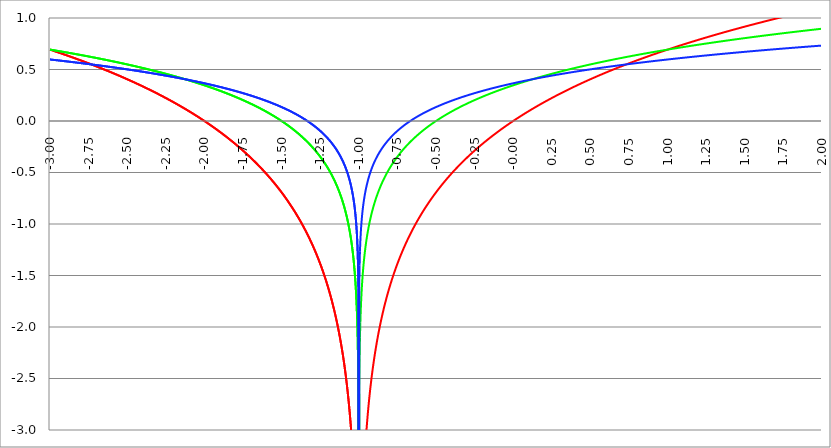
| Category | Series 1 | Series 0 | Series 2 |
|---|---|---|---|
| -3.0 | 0.693 | 0.693 | 0.597 |
| -2.9975 | 0.692 | 0.693 | 0.597 |
| -2.995 | 0.691 | 0.692 | 0.596 |
| -2.9925 | 0.689 | 0.691 | 0.596 |
| -2.99 | 0.688 | 0.691 | 0.596 |
| -2.9875 | 0.687 | 0.69 | 0.595 |
| -2.985 | 0.686 | 0.689 | 0.595 |
| -2.9825 | 0.684 | 0.689 | 0.594 |
| -2.98 | 0.683 | 0.688 | 0.594 |
| -2.9775 | 0.682 | 0.687 | 0.593 |
| -2.975000000000001 | 0.681 | 0.687 | 0.593 |
| -2.972500000000001 | 0.679 | 0.686 | 0.593 |
| -2.970000000000001 | 0.678 | 0.686 | 0.592 |
| -2.967500000000001 | 0.677 | 0.685 | 0.592 |
| -2.965000000000001 | 0.675 | 0.684 | 0.591 |
| -2.962500000000001 | 0.674 | 0.684 | 0.591 |
| -2.960000000000001 | 0.673 | 0.683 | 0.591 |
| -2.957500000000001 | 0.672 | 0.682 | 0.59 |
| -2.955000000000001 | 0.67 | 0.682 | 0.59 |
| -2.952500000000001 | 0.669 | 0.681 | 0.589 |
| -2.950000000000001 | 0.668 | 0.68 | 0.589 |
| -2.947500000000001 | 0.667 | 0.68 | 0.588 |
| -2.945000000000001 | 0.665 | 0.679 | 0.588 |
| -2.942500000000001 | 0.664 | 0.679 | 0.588 |
| -2.940000000000001 | 0.663 | 0.678 | 0.587 |
| -2.937500000000001 | 0.661 | 0.677 | 0.587 |
| -2.935000000000001 | 0.66 | 0.677 | 0.586 |
| -2.932500000000001 | 0.659 | 0.676 | 0.586 |
| -2.930000000000001 | 0.658 | 0.675 | 0.585 |
| -2.927500000000002 | 0.656 | 0.675 | 0.585 |
| -2.925000000000002 | 0.655 | 0.674 | 0.585 |
| -2.922500000000002 | 0.654 | 0.673 | 0.584 |
| -2.920000000000002 | 0.652 | 0.673 | 0.584 |
| -2.917500000000002 | 0.651 | 0.672 | 0.583 |
| -2.915000000000002 | 0.65 | 0.671 | 0.583 |
| -2.912500000000002 | 0.648 | 0.671 | 0.582 |
| -2.910000000000002 | 0.647 | 0.67 | 0.582 |
| -2.907500000000002 | 0.646 | 0.669 | 0.581 |
| -2.905000000000002 | 0.644 | 0.669 | 0.581 |
| -2.902500000000002 | 0.643 | 0.668 | 0.581 |
| -2.900000000000002 | 0.642 | 0.668 | 0.58 |
| -2.897500000000002 | 0.641 | 0.667 | 0.58 |
| -2.895000000000002 | 0.639 | 0.666 | 0.579 |
| -2.892500000000002 | 0.638 | 0.666 | 0.579 |
| -2.890000000000002 | 0.637 | 0.665 | 0.578 |
| -2.887500000000002 | 0.635 | 0.664 | 0.578 |
| -2.885000000000002 | 0.634 | 0.664 | 0.578 |
| -2.882500000000002 | 0.633 | 0.663 | 0.577 |
| -2.880000000000002 | 0.631 | 0.662 | 0.577 |
| -2.877500000000003 | 0.63 | 0.662 | 0.576 |
| -2.875000000000003 | 0.629 | 0.661 | 0.576 |
| -2.872500000000003 | 0.627 | 0.66 | 0.575 |
| -2.870000000000003 | 0.626 | 0.66 | 0.575 |
| -2.867500000000003 | 0.625 | 0.659 | 0.574 |
| -2.865000000000003 | 0.623 | 0.658 | 0.574 |
| -2.862500000000003 | 0.622 | 0.658 | 0.574 |
| -2.860000000000003 | 0.621 | 0.657 | 0.573 |
| -2.857500000000003 | 0.619 | 0.656 | 0.573 |
| -2.855000000000003 | 0.618 | 0.656 | 0.572 |
| -2.852500000000003 | 0.617 | 0.655 | 0.572 |
| -2.850000000000003 | 0.615 | 0.654 | 0.571 |
| -2.847500000000003 | 0.614 | 0.653 | 0.571 |
| -2.845000000000003 | 0.612 | 0.653 | 0.57 |
| -2.842500000000003 | 0.611 | 0.652 | 0.57 |
| -2.840000000000003 | 0.61 | 0.651 | 0.569 |
| -2.837500000000003 | 0.608 | 0.651 | 0.569 |
| -2.835000000000003 | 0.607 | 0.65 | 0.569 |
| -2.832500000000004 | 0.606 | 0.649 | 0.568 |
| -2.830000000000004 | 0.604 | 0.649 | 0.568 |
| -2.827500000000004 | 0.603 | 0.648 | 0.567 |
| -2.825000000000004 | 0.602 | 0.647 | 0.567 |
| -2.822500000000004 | 0.6 | 0.647 | 0.566 |
| -2.820000000000004 | 0.599 | 0.646 | 0.566 |
| -2.817500000000004 | 0.597 | 0.645 | 0.565 |
| -2.815000000000004 | 0.596 | 0.645 | 0.565 |
| -2.812500000000004 | 0.595 | 0.644 | 0.564 |
| -2.810000000000004 | 0.593 | 0.643 | 0.564 |
| -2.807500000000004 | 0.592 | 0.643 | 0.564 |
| -2.805000000000004 | 0.591 | 0.642 | 0.563 |
| -2.802500000000004 | 0.589 | 0.641 | 0.563 |
| -2.800000000000004 | 0.588 | 0.64 | 0.562 |
| -2.797500000000004 | 0.586 | 0.64 | 0.562 |
| -2.795000000000004 | 0.585 | 0.639 | 0.561 |
| -2.792500000000004 | 0.584 | 0.638 | 0.561 |
| -2.790000000000004 | 0.582 | 0.638 | 0.56 |
| -2.787500000000004 | 0.581 | 0.637 | 0.56 |
| -2.785000000000004 | 0.579 | 0.636 | 0.559 |
| -2.782500000000005 | 0.578 | 0.636 | 0.559 |
| -2.780000000000005 | 0.577 | 0.635 | 0.558 |
| -2.777500000000005 | 0.575 | 0.634 | 0.558 |
| -2.775000000000005 | 0.574 | 0.633 | 0.557 |
| -2.772500000000005 | 0.572 | 0.633 | 0.557 |
| -2.770000000000005 | 0.571 | 0.632 | 0.557 |
| -2.767500000000005 | 0.57 | 0.631 | 0.556 |
| -2.765000000000005 | 0.568 | 0.631 | 0.556 |
| -2.762500000000005 | 0.567 | 0.63 | 0.555 |
| -2.760000000000005 | 0.565 | 0.629 | 0.555 |
| -2.757500000000005 | 0.564 | 0.629 | 0.554 |
| -2.755000000000005 | 0.562 | 0.628 | 0.554 |
| -2.752500000000005 | 0.561 | 0.627 | 0.553 |
| -2.750000000000005 | 0.56 | 0.626 | 0.553 |
| -2.747500000000005 | 0.558 | 0.626 | 0.552 |
| -2.745000000000005 | 0.557 | 0.625 | 0.552 |
| -2.742500000000005 | 0.555 | 0.624 | 0.551 |
| -2.740000000000005 | 0.554 | 0.624 | 0.551 |
| -2.737500000000006 | 0.552 | 0.623 | 0.55 |
| -2.735000000000006 | 0.551 | 0.622 | 0.55 |
| -2.732500000000006 | 0.55 | 0.621 | 0.549 |
| -2.730000000000006 | 0.548 | 0.621 | 0.549 |
| -2.727500000000006 | 0.547 | 0.62 | 0.548 |
| -2.725000000000006 | 0.545 | 0.619 | 0.548 |
| -2.722500000000006 | 0.544 | 0.618 | 0.547 |
| -2.720000000000006 | 0.542 | 0.618 | 0.547 |
| -2.717500000000006 | 0.541 | 0.617 | 0.546 |
| -2.715000000000006 | 0.539 | 0.616 | 0.546 |
| -2.712500000000006 | 0.538 | 0.616 | 0.546 |
| -2.710000000000006 | 0.536 | 0.615 | 0.545 |
| -2.707500000000006 | 0.535 | 0.614 | 0.545 |
| -2.705000000000006 | 0.534 | 0.613 | 0.544 |
| -2.702500000000006 | 0.532 | 0.613 | 0.544 |
| -2.700000000000006 | 0.531 | 0.612 | 0.543 |
| -2.697500000000006 | 0.529 | 0.611 | 0.543 |
| -2.695000000000006 | 0.528 | 0.61 | 0.542 |
| -2.692500000000006 | 0.526 | 0.61 | 0.542 |
| -2.690000000000006 | 0.525 | 0.609 | 0.541 |
| -2.687500000000006 | 0.523 | 0.608 | 0.541 |
| -2.685000000000007 | 0.522 | 0.607 | 0.54 |
| -2.682500000000007 | 0.52 | 0.607 | 0.54 |
| -2.680000000000007 | 0.519 | 0.606 | 0.539 |
| -2.677500000000007 | 0.517 | 0.605 | 0.539 |
| -2.675000000000007 | 0.516 | 0.604 | 0.538 |
| -2.672500000000007 | 0.514 | 0.604 | 0.538 |
| -2.670000000000007 | 0.513 | 0.603 | 0.537 |
| -2.667500000000007 | 0.511 | 0.602 | 0.537 |
| -2.665000000000007 | 0.51 | 0.601 | 0.536 |
| -2.662500000000007 | 0.508 | 0.601 | 0.536 |
| -2.660000000000007 | 0.507 | 0.6 | 0.535 |
| -2.657500000000007 | 0.505 | 0.599 | 0.535 |
| -2.655000000000007 | 0.504 | 0.598 | 0.534 |
| -2.652500000000007 | 0.502 | 0.598 | 0.534 |
| -2.650000000000007 | 0.501 | 0.597 | 0.533 |
| -2.647500000000007 | 0.499 | 0.596 | 0.533 |
| -2.645000000000007 | 0.498 | 0.595 | 0.532 |
| -2.642500000000008 | 0.496 | 0.595 | 0.532 |
| -2.640000000000008 | 0.495 | 0.594 | 0.531 |
| -2.637500000000008 | 0.493 | 0.593 | 0.531 |
| -2.635000000000008 | 0.492 | 0.592 | 0.53 |
| -2.632500000000008 | 0.49 | 0.592 | 0.53 |
| -2.630000000000008 | 0.489 | 0.591 | 0.529 |
| -2.627500000000008 | 0.487 | 0.59 | 0.529 |
| -2.625000000000008 | 0.486 | 0.589 | 0.528 |
| -2.622500000000008 | 0.484 | 0.589 | 0.528 |
| -2.620000000000008 | 0.482 | 0.588 | 0.527 |
| -2.617500000000008 | 0.481 | 0.587 | 0.526 |
| -2.615000000000008 | 0.479 | 0.586 | 0.526 |
| -2.612500000000008 | 0.478 | 0.585 | 0.525 |
| -2.610000000000008 | 0.476 | 0.585 | 0.525 |
| -2.607500000000008 | 0.475 | 0.584 | 0.524 |
| -2.605000000000008 | 0.473 | 0.583 | 0.524 |
| -2.602500000000008 | 0.472 | 0.582 | 0.523 |
| -2.600000000000008 | 0.47 | 0.582 | 0.523 |
| -2.597500000000009 | 0.468 | 0.581 | 0.522 |
| -2.595000000000009 | 0.467 | 0.58 | 0.522 |
| -2.592500000000009 | 0.465 | 0.579 | 0.521 |
| -2.590000000000009 | 0.464 | 0.578 | 0.521 |
| -2.587500000000009 | 0.462 | 0.578 | 0.52 |
| -2.585000000000009 | 0.461 | 0.577 | 0.52 |
| -2.582500000000009 | 0.459 | 0.576 | 0.519 |
| -2.580000000000009 | 0.457 | 0.575 | 0.519 |
| -2.577500000000009 | 0.456 | 0.574 | 0.518 |
| -2.575000000000009 | 0.454 | 0.574 | 0.518 |
| -2.572500000000009 | 0.453 | 0.573 | 0.517 |
| -2.570000000000009 | 0.451 | 0.572 | 0.517 |
| -2.56750000000001 | 0.449 | 0.571 | 0.516 |
| -2.565000000000009 | 0.448 | 0.571 | 0.515 |
| -2.562500000000009 | 0.446 | 0.57 | 0.515 |
| -2.560000000000009 | 0.445 | 0.569 | 0.514 |
| -2.557500000000009 | 0.443 | 0.568 | 0.514 |
| -2.555000000000009 | 0.441 | 0.567 | 0.513 |
| -2.55250000000001 | 0.44 | 0.567 | 0.513 |
| -2.55000000000001 | 0.438 | 0.566 | 0.512 |
| -2.54750000000001 | 0.437 | 0.565 | 0.512 |
| -2.54500000000001 | 0.435 | 0.564 | 0.511 |
| -2.54250000000001 | 0.433 | 0.563 | 0.511 |
| -2.54000000000001 | 0.432 | 0.562 | 0.51 |
| -2.53750000000001 | 0.43 | 0.562 | 0.51 |
| -2.53500000000001 | 0.429 | 0.561 | 0.509 |
| -2.53250000000001 | 0.427 | 0.56 | 0.509 |
| -2.53000000000001 | 0.425 | 0.559 | 0.508 |
| -2.52750000000001 | 0.424 | 0.558 | 0.507 |
| -2.52500000000001 | 0.422 | 0.558 | 0.507 |
| -2.52250000000001 | 0.42 | 0.557 | 0.506 |
| -2.52000000000001 | 0.419 | 0.556 | 0.506 |
| -2.51750000000001 | 0.417 | 0.555 | 0.505 |
| -2.51500000000001 | 0.415 | 0.554 | 0.505 |
| -2.51250000000001 | 0.414 | 0.553 | 0.504 |
| -2.51000000000001 | 0.412 | 0.553 | 0.504 |
| -2.50750000000001 | 0.41 | 0.552 | 0.503 |
| -2.505000000000011 | 0.409 | 0.551 | 0.502 |
| -2.502500000000011 | 0.407 | 0.55 | 0.502 |
| -2.500000000000011 | 0.405 | 0.549 | 0.501 |
| -2.497500000000011 | 0.404 | 0.548 | 0.501 |
| -2.495000000000011 | 0.402 | 0.548 | 0.5 |
| -2.492500000000011 | 0.4 | 0.547 | 0.5 |
| -2.490000000000011 | 0.399 | 0.546 | 0.499 |
| -2.487500000000011 | 0.397 | 0.545 | 0.499 |
| -2.485000000000011 | 0.395 | 0.544 | 0.498 |
| -2.482500000000011 | 0.394 | 0.543 | 0.497 |
| -2.480000000000011 | 0.392 | 0.543 | 0.497 |
| -2.477500000000011 | 0.39 | 0.542 | 0.496 |
| -2.475000000000011 | 0.389 | 0.541 | 0.496 |
| -2.472500000000011 | 0.387 | 0.54 | 0.495 |
| -2.470000000000011 | 0.385 | 0.539 | 0.495 |
| -2.467500000000011 | 0.384 | 0.538 | 0.494 |
| -2.465000000000011 | 0.382 | 0.538 | 0.493 |
| -2.462500000000011 | 0.38 | 0.537 | 0.493 |
| -2.460000000000011 | 0.378 | 0.536 | 0.492 |
| -2.457500000000012 | 0.377 | 0.535 | 0.492 |
| -2.455000000000012 | 0.375 | 0.534 | 0.491 |
| -2.452500000000012 | 0.373 | 0.533 | 0.491 |
| -2.450000000000012 | 0.372 | 0.532 | 0.49 |
| -2.447500000000012 | 0.37 | 0.531 | 0.489 |
| -2.445000000000012 | 0.368 | 0.531 | 0.489 |
| -2.442500000000012 | 0.366 | 0.53 | 0.488 |
| -2.440000000000012 | 0.365 | 0.529 | 0.488 |
| -2.437500000000012 | 0.363 | 0.528 | 0.487 |
| -2.435000000000012 | 0.361 | 0.527 | 0.487 |
| -2.432500000000012 | 0.359 | 0.526 | 0.486 |
| -2.430000000000012 | 0.358 | 0.525 | 0.485 |
| -2.427500000000012 | 0.356 | 0.525 | 0.485 |
| -2.425000000000012 | 0.354 | 0.524 | 0.484 |
| -2.422500000000012 | 0.352 | 0.523 | 0.484 |
| -2.420000000000012 | 0.351 | 0.522 | 0.483 |
| -2.417500000000012 | 0.349 | 0.521 | 0.483 |
| -2.415000000000012 | 0.347 | 0.52 | 0.482 |
| -2.412500000000012 | 0.345 | 0.519 | 0.481 |
| -2.410000000000013 | 0.344 | 0.518 | 0.481 |
| -2.407500000000012 | 0.342 | 0.517 | 0.48 |
| -2.405000000000013 | 0.34 | 0.517 | 0.48 |
| -2.402500000000013 | 0.338 | 0.516 | 0.479 |
| -2.400000000000013 | 0.336 | 0.515 | 0.478 |
| -2.397500000000013 | 0.335 | 0.514 | 0.478 |
| -2.395000000000013 | 0.333 | 0.513 | 0.477 |
| -2.392500000000013 | 0.331 | 0.512 | 0.477 |
| -2.390000000000013 | 0.329 | 0.511 | 0.476 |
| -2.387500000000013 | 0.328 | 0.51 | 0.475 |
| -2.385000000000013 | 0.326 | 0.509 | 0.475 |
| -2.382500000000013 | 0.324 | 0.509 | 0.474 |
| -2.380000000000013 | 0.322 | 0.508 | 0.474 |
| -2.377500000000013 | 0.32 | 0.507 | 0.473 |
| -2.375000000000013 | 0.318 | 0.506 | 0.472 |
| -2.372500000000013 | 0.317 | 0.505 | 0.472 |
| -2.370000000000013 | 0.315 | 0.504 | 0.471 |
| -2.367500000000013 | 0.313 | 0.503 | 0.471 |
| -2.365000000000013 | 0.311 | 0.502 | 0.47 |
| -2.362500000000014 | 0.309 | 0.501 | 0.469 |
| -2.360000000000014 | 0.307 | 0.5 | 0.469 |
| -2.357500000000014 | 0.306 | 0.499 | 0.468 |
| -2.355000000000014 | 0.304 | 0.498 | 0.467 |
| -2.352500000000014 | 0.302 | 0.498 | 0.467 |
| -2.350000000000014 | 0.3 | 0.497 | 0.466 |
| -2.347500000000014 | 0.298 | 0.496 | 0.466 |
| -2.345000000000014 | 0.296 | 0.495 | 0.465 |
| -2.342500000000014 | 0.295 | 0.494 | 0.464 |
| -2.340000000000014 | 0.293 | 0.493 | 0.464 |
| -2.337500000000014 | 0.291 | 0.492 | 0.463 |
| -2.335000000000014 | 0.289 | 0.491 | 0.463 |
| -2.332500000000014 | 0.287 | 0.49 | 0.462 |
| -2.330000000000014 | 0.285 | 0.489 | 0.461 |
| -2.327500000000014 | 0.283 | 0.488 | 0.461 |
| -2.325000000000014 | 0.281 | 0.487 | 0.46 |
| -2.322500000000014 | 0.28 | 0.486 | 0.459 |
| -2.320000000000014 | 0.278 | 0.485 | 0.459 |
| -2.317500000000015 | 0.276 | 0.484 | 0.458 |
| -2.315000000000015 | 0.274 | 0.483 | 0.457 |
| -2.312500000000015 | 0.272 | 0.483 | 0.457 |
| -2.310000000000015 | 0.27 | 0.482 | 0.456 |
| -2.307500000000015 | 0.268 | 0.481 | 0.456 |
| -2.305000000000015 | 0.266 | 0.48 | 0.455 |
| -2.302500000000015 | 0.264 | 0.479 | 0.454 |
| -2.300000000000015 | 0.262 | 0.478 | 0.454 |
| -2.297500000000015 | 0.26 | 0.477 | 0.453 |
| -2.295000000000015 | 0.259 | 0.476 | 0.452 |
| -2.292500000000015 | 0.257 | 0.475 | 0.452 |
| -2.290000000000015 | 0.255 | 0.474 | 0.451 |
| -2.287500000000015 | 0.253 | 0.473 | 0.45 |
| -2.285000000000015 | 0.251 | 0.472 | 0.45 |
| -2.282500000000015 | 0.249 | 0.471 | 0.449 |
| -2.280000000000015 | 0.247 | 0.47 | 0.448 |
| -2.277500000000015 | 0.245 | 0.469 | 0.448 |
| -2.275000000000015 | 0.243 | 0.468 | 0.447 |
| -2.272500000000015 | 0.241 | 0.467 | 0.447 |
| -2.270000000000016 | 0.239 | 0.466 | 0.446 |
| -2.267500000000015 | 0.237 | 0.465 | 0.445 |
| -2.265000000000016 | 0.235 | 0.464 | 0.445 |
| -2.262500000000016 | 0.233 | 0.463 | 0.444 |
| -2.260000000000016 | 0.231 | 0.462 | 0.443 |
| -2.257500000000016 | 0.229 | 0.461 | 0.443 |
| -2.255000000000016 | 0.227 | 0.46 | 0.442 |
| -2.252500000000016 | 0.225 | 0.459 | 0.441 |
| -2.250000000000016 | 0.223 | 0.458 | 0.441 |
| -2.247500000000016 | 0.221 | 0.457 | 0.44 |
| -2.245000000000016 | 0.219 | 0.456 | 0.439 |
| -2.242500000000016 | 0.217 | 0.455 | 0.439 |
| -2.240000000000016 | 0.215 | 0.454 | 0.438 |
| -2.237500000000016 | 0.213 | 0.453 | 0.437 |
| -2.235000000000016 | 0.211 | 0.452 | 0.437 |
| -2.232500000000016 | 0.209 | 0.451 | 0.436 |
| -2.230000000000016 | 0.207 | 0.45 | 0.435 |
| -2.227500000000016 | 0.205 | 0.449 | 0.435 |
| -2.225000000000016 | 0.203 | 0.448 | 0.434 |
| -2.222500000000016 | 0.201 | 0.447 | 0.433 |
| -2.220000000000016 | 0.199 | 0.446 | 0.432 |
| -2.217500000000016 | 0.197 | 0.445 | 0.432 |
| -2.215000000000017 | 0.195 | 0.444 | 0.431 |
| -2.212500000000017 | 0.193 | 0.443 | 0.43 |
| -2.210000000000017 | 0.191 | 0.442 | 0.43 |
| -2.207500000000016 | 0.189 | 0.441 | 0.429 |
| -2.205000000000017 | 0.186 | 0.44 | 0.428 |
| -2.202500000000017 | 0.184 | 0.439 | 0.428 |
| -2.200000000000017 | 0.182 | 0.438 | 0.427 |
| -2.197500000000017 | 0.18 | 0.437 | 0.426 |
| -2.195000000000017 | 0.178 | 0.436 | 0.426 |
| -2.192500000000017 | 0.176 | 0.435 | 0.425 |
| -2.190000000000017 | 0.174 | 0.434 | 0.424 |
| -2.187500000000017 | 0.172 | 0.432 | 0.423 |
| -2.185000000000017 | 0.17 | 0.431 | 0.423 |
| -2.182500000000017 | 0.168 | 0.43 | 0.422 |
| -2.180000000000017 | 0.166 | 0.429 | 0.421 |
| -2.177500000000017 | 0.163 | 0.428 | 0.421 |
| -2.175000000000018 | 0.161 | 0.427 | 0.42 |
| -2.172500000000018 | 0.159 | 0.426 | 0.419 |
| -2.170000000000018 | 0.157 | 0.425 | 0.419 |
| -2.167500000000017 | 0.155 | 0.424 | 0.418 |
| -2.165000000000018 | 0.153 | 0.423 | 0.417 |
| -2.162500000000018 | 0.151 | 0.422 | 0.416 |
| -2.160000000000018 | 0.148 | 0.421 | 0.416 |
| -2.157500000000018 | 0.146 | 0.42 | 0.415 |
| -2.155000000000018 | 0.144 | 0.419 | 0.414 |
| -2.152500000000018 | 0.142 | 0.418 | 0.414 |
| -2.150000000000018 | 0.14 | 0.416 | 0.413 |
| -2.147500000000018 | 0.138 | 0.415 | 0.412 |
| -2.145000000000018 | 0.135 | 0.414 | 0.411 |
| -2.142500000000018 | 0.133 | 0.413 | 0.411 |
| -2.140000000000018 | 0.131 | 0.412 | 0.41 |
| -2.137500000000018 | 0.129 | 0.411 | 0.409 |
| -2.135000000000018 | 0.127 | 0.41 | 0.408 |
| -2.132500000000018 | 0.124 | 0.409 | 0.408 |
| -2.130000000000019 | 0.122 | 0.408 | 0.407 |
| -2.127500000000018 | 0.12 | 0.407 | 0.406 |
| -2.125000000000019 | 0.118 | 0.405 | 0.405 |
| -2.122500000000019 | 0.116 | 0.404 | 0.405 |
| -2.120000000000019 | 0.113 | 0.403 | 0.404 |
| -2.117500000000019 | 0.111 | 0.402 | 0.403 |
| -2.115000000000019 | 0.109 | 0.401 | 0.402 |
| -2.112500000000019 | 0.107 | 0.4 | 0.402 |
| -2.110000000000019 | 0.104 | 0.399 | 0.401 |
| -2.10750000000002 | 0.102 | 0.398 | 0.4 |
| -2.10500000000002 | 0.1 | 0.396 | 0.399 |
| -2.10250000000002 | 0.098 | 0.395 | 0.399 |
| -2.10000000000002 | 0.095 | 0.394 | 0.398 |
| -2.09750000000002 | 0.093 | 0.393 | 0.397 |
| -2.095000000000019 | 0.091 | 0.392 | 0.396 |
| -2.092500000000019 | 0.088 | 0.391 | 0.396 |
| -2.090000000000019 | 0.086 | 0.39 | 0.395 |
| -2.08750000000002 | 0.084 | 0.389 | 0.394 |
| -2.085000000000019 | 0.082 | 0.387 | 0.393 |
| -2.08250000000002 | 0.079 | 0.386 | 0.393 |
| -2.08000000000002 | 0.077 | 0.385 | 0.392 |
| -2.07750000000002 | 0.075 | 0.384 | 0.391 |
| -2.07500000000002 | 0.072 | 0.383 | 0.39 |
| -2.07250000000002 | 0.07 | 0.382 | 0.39 |
| -2.07000000000002 | 0.068 | 0.38 | 0.389 |
| -2.06750000000002 | 0.065 | 0.379 | 0.388 |
| -2.06500000000002 | 0.063 | 0.378 | 0.387 |
| -2.06250000000002 | 0.061 | 0.377 | 0.386 |
| -2.06000000000002 | 0.058 | 0.376 | 0.386 |
| -2.05750000000002 | 0.056 | 0.375 | 0.385 |
| -2.05500000000002 | 0.054 | 0.373 | 0.384 |
| -2.05250000000002 | 0.051 | 0.372 | 0.383 |
| -2.05000000000002 | 0.049 | 0.371 | 0.382 |
| -2.04750000000002 | 0.046 | 0.37 | 0.382 |
| -2.04500000000002 | 0.044 | 0.369 | 0.381 |
| -2.04250000000002 | 0.042 | 0.367 | 0.38 |
| -2.04000000000002 | 0.039 | 0.366 | 0.379 |
| -2.037500000000021 | 0.037 | 0.365 | 0.378 |
| -2.035000000000021 | 0.034 | 0.364 | 0.378 |
| -2.032500000000021 | 0.032 | 0.363 | 0.377 |
| -2.030000000000021 | 0.03 | 0.361 | 0.376 |
| -2.027500000000021 | 0.027 | 0.36 | 0.375 |
| -2.025000000000021 | 0.025 | 0.359 | 0.374 |
| -2.022500000000021 | 0.022 | 0.358 | 0.374 |
| -2.020000000000021 | 0.02 | 0.356 | 0.373 |
| -2.017500000000021 | 0.017 | 0.355 | 0.372 |
| -2.015000000000021 | 0.015 | 0.354 | 0.371 |
| -2.012500000000021 | 0.012 | 0.353 | 0.37 |
| -2.010000000000021 | 0.01 | 0.352 | 0.37 |
| -2.007500000000021 | 0.007 | 0.35 | 0.369 |
| -2.005000000000021 | 0.005 | 0.349 | 0.368 |
| -2.002500000000021 | 0.002 | 0.348 | 0.367 |
| -2.000000000000021 | 0 | 0.347 | 0.366 |
| -1.997500000000021 | -0.003 | 0.345 | 0.365 |
| -1.995000000000021 | -0.005 | 0.344 | 0.365 |
| -1.992500000000021 | -0.008 | 0.343 | 0.364 |
| -1.990000000000021 | -0.01 | 0.342 | 0.363 |
| -1.987500000000022 | -0.013 | 0.34 | 0.362 |
| -1.985000000000022 | -0.015 | 0.339 | 0.361 |
| -1.982500000000022 | -0.018 | 0.338 | 0.36 |
| -1.980000000000022 | -0.02 | 0.336 | 0.359 |
| -1.977500000000022 | -0.023 | 0.335 | 0.359 |
| -1.975000000000022 | -0.025 | 0.334 | 0.358 |
| -1.972500000000022 | -0.028 | 0.333 | 0.357 |
| -1.970000000000022 | -0.03 | 0.331 | 0.356 |
| -1.967500000000022 | -0.033 | 0.33 | 0.355 |
| -1.965000000000022 | -0.036 | 0.329 | 0.354 |
| -1.962500000000022 | -0.038 | 0.327 | 0.353 |
| -1.960000000000022 | -0.041 | 0.326 | 0.353 |
| -1.957500000000022 | -0.043 | 0.325 | 0.352 |
| -1.955000000000022 | -0.046 | 0.324 | 0.351 |
| -1.952500000000022 | -0.049 | 0.322 | 0.35 |
| -1.950000000000022 | -0.051 | 0.321 | 0.349 |
| -1.947500000000022 | -0.054 | 0.32 | 0.348 |
| -1.945000000000022 | -0.057 | 0.318 | 0.347 |
| -1.942500000000023 | -0.059 | 0.317 | 0.346 |
| -1.940000000000023 | -0.062 | 0.316 | 0.346 |
| -1.937500000000023 | -0.065 | 0.314 | 0.345 |
| -1.935000000000023 | -0.067 | 0.313 | 0.344 |
| -1.932500000000023 | -0.07 | 0.312 | 0.343 |
| -1.930000000000023 | -0.073 | 0.31 | 0.342 |
| -1.927500000000023 | -0.075 | 0.309 | 0.341 |
| -1.925000000000023 | -0.078 | 0.308 | 0.34 |
| -1.922500000000023 | -0.081 | 0.306 | 0.339 |
| -1.920000000000023 | -0.083 | 0.305 | 0.338 |
| -1.917500000000023 | -0.086 | 0.304 | 0.338 |
| -1.915000000000023 | -0.089 | 0.302 | 0.337 |
| -1.912500000000023 | -0.092 | 0.301 | 0.336 |
| -1.910000000000023 | -0.094 | 0.299 | 0.335 |
| -1.907500000000023 | -0.097 | 0.298 | 0.334 |
| -1.905000000000023 | -0.1 | 0.297 | 0.333 |
| -1.902500000000023 | -0.103 | 0.295 | 0.332 |
| -1.900000000000023 | -0.105 | 0.294 | 0.331 |
| -1.897500000000023 | -0.108 | 0.293 | 0.33 |
| -1.895000000000023 | -0.111 | 0.291 | 0.329 |
| -1.892500000000024 | -0.114 | 0.29 | 0.328 |
| -1.890000000000024 | -0.117 | 0.288 | 0.327 |
| -1.887500000000024 | -0.119 | 0.287 | 0.326 |
| -1.885000000000024 | -0.122 | 0.285 | 0.325 |
| -1.882500000000024 | -0.125 | 0.284 | 0.325 |
| -1.880000000000024 | -0.128 | 0.283 | 0.324 |
| -1.877500000000024 | -0.131 | 0.281 | 0.323 |
| -1.875000000000024 | -0.134 | 0.28 | 0.322 |
| -1.872500000000024 | -0.136 | 0.278 | 0.321 |
| -1.870000000000024 | -0.139 | 0.277 | 0.32 |
| -1.867500000000024 | -0.142 | 0.276 | 0.319 |
| -1.865000000000024 | -0.145 | 0.274 | 0.318 |
| -1.862500000000024 | -0.148 | 0.273 | 0.317 |
| -1.860000000000024 | -0.151 | 0.271 | 0.316 |
| -1.857500000000024 | -0.154 | 0.27 | 0.315 |
| -1.855000000000024 | -0.157 | 0.268 | 0.314 |
| -1.852500000000024 | -0.16 | 0.267 | 0.313 |
| -1.850000000000024 | -0.163 | 0.265 | 0.312 |
| -1.847500000000025 | -0.165 | 0.264 | 0.311 |
| -1.845000000000025 | -0.168 | 0.262 | 0.31 |
| -1.842500000000025 | -0.171 | 0.261 | 0.309 |
| -1.840000000000025 | -0.174 | 0.259 | 0.308 |
| -1.837500000000025 | -0.177 | 0.258 | 0.307 |
| -1.835000000000025 | -0.18 | 0.256 | 0.306 |
| -1.832500000000025 | -0.183 | 0.255 | 0.305 |
| -1.830000000000025 | -0.186 | 0.253 | 0.304 |
| -1.827500000000025 | -0.189 | 0.252 | 0.303 |
| -1.825000000000025 | -0.192 | 0.25 | 0.302 |
| -1.822500000000025 | -0.195 | 0.249 | 0.301 |
| -1.820000000000025 | -0.198 | 0.247 | 0.3 |
| -1.817500000000025 | -0.202 | 0.246 | 0.299 |
| -1.815000000000025 | -0.205 | 0.244 | 0.298 |
| -1.812500000000025 | -0.208 | 0.243 | 0.297 |
| -1.810000000000025 | -0.211 | 0.241 | 0.296 |
| -1.807500000000025 | -0.214 | 0.24 | 0.295 |
| -1.805000000000025 | -0.217 | 0.238 | 0.294 |
| -1.802500000000025 | -0.22 | 0.237 | 0.293 |
| -1.800000000000026 | -0.223 | 0.235 | 0.292 |
| -1.797500000000026 | -0.226 | 0.233 | 0.291 |
| -1.795000000000026 | -0.229 | 0.232 | 0.29 |
| -1.792500000000026 | -0.233 | 0.23 | 0.289 |
| -1.790000000000026 | -0.236 | 0.229 | 0.288 |
| -1.787500000000026 | -0.239 | 0.227 | 0.287 |
| -1.785000000000026 | -0.242 | 0.226 | 0.286 |
| -1.782500000000026 | -0.245 | 0.224 | 0.284 |
| -1.780000000000026 | -0.248 | 0.222 | 0.283 |
| -1.777500000000026 | -0.252 | 0.221 | 0.282 |
| -1.775000000000026 | -0.255 | 0.219 | 0.281 |
| -1.772500000000026 | -0.258 | 0.218 | 0.28 |
| -1.770000000000026 | -0.261 | 0.216 | 0.279 |
| -1.767500000000026 | -0.265 | 0.214 | 0.278 |
| -1.765000000000026 | -0.268 | 0.213 | 0.277 |
| -1.762500000000026 | -0.271 | 0.211 | 0.276 |
| -1.760000000000026 | -0.274 | 0.209 | 0.275 |
| -1.757500000000026 | -0.278 | 0.208 | 0.274 |
| -1.755000000000026 | -0.281 | 0.206 | 0.273 |
| -1.752500000000027 | -0.284 | 0.204 | 0.271 |
| -1.750000000000027 | -0.288 | 0.203 | 0.27 |
| -1.747500000000027 | -0.291 | 0.201 | 0.269 |
| -1.745000000000027 | -0.294 | 0.199 | 0.268 |
| -1.742500000000027 | -0.298 | 0.198 | 0.267 |
| -1.740000000000027 | -0.301 | 0.196 | 0.266 |
| -1.737500000000027 | -0.304 | 0.194 | 0.265 |
| -1.735000000000027 | -0.308 | 0.193 | 0.264 |
| -1.732500000000027 | -0.311 | 0.191 | 0.262 |
| -1.730000000000027 | -0.315 | 0.189 | 0.261 |
| -1.727500000000027 | -0.318 | 0.188 | 0.26 |
| -1.725000000000027 | -0.322 | 0.186 | 0.259 |
| -1.722500000000027 | -0.325 | 0.184 | 0.258 |
| -1.720000000000027 | -0.329 | 0.182 | 0.257 |
| -1.717500000000027 | -0.332 | 0.181 | 0.256 |
| -1.715000000000027 | -0.335 | 0.179 | 0.254 |
| -1.712500000000027 | -0.339 | 0.177 | 0.253 |
| -1.710000000000027 | -0.342 | 0.175 | 0.252 |
| -1.707500000000027 | -0.346 | 0.174 | 0.251 |
| -1.705000000000028 | -0.35 | 0.172 | 0.25 |
| -1.702500000000028 | -0.353 | 0.17 | 0.249 |
| -1.700000000000028 | -0.357 | 0.168 | 0.247 |
| -1.697500000000028 | -0.36 | 0.166 | 0.246 |
| -1.695000000000028 | -0.364 | 0.165 | 0.245 |
| -1.692500000000028 | -0.367 | 0.163 | 0.244 |
| -1.690000000000028 | -0.371 | 0.161 | 0.243 |
| -1.687500000000028 | -0.375 | 0.159 | 0.241 |
| -1.685000000000028 | -0.378 | 0.157 | 0.24 |
| -1.682500000000028 | -0.382 | 0.156 | 0.239 |
| -1.680000000000028 | -0.386 | 0.154 | 0.238 |
| -1.677500000000028 | -0.389 | 0.152 | 0.236 |
| -1.675000000000028 | -0.393 | 0.15 | 0.235 |
| -1.672500000000028 | -0.397 | 0.148 | 0.234 |
| -1.670000000000028 | -0.4 | 0.146 | 0.233 |
| -1.667500000000028 | -0.404 | 0.144 | 0.231 |
| -1.665000000000028 | -0.408 | 0.143 | 0.23 |
| -1.662500000000028 | -0.412 | 0.141 | 0.229 |
| -1.660000000000028 | -0.416 | 0.139 | 0.228 |
| -1.657500000000029 | -0.419 | 0.137 | 0.226 |
| -1.655000000000029 | -0.423 | 0.135 | 0.225 |
| -1.652500000000029 | -0.427 | 0.133 | 0.224 |
| -1.650000000000029 | -0.431 | 0.131 | 0.223 |
| -1.647500000000029 | -0.435 | 0.129 | 0.221 |
| -1.645000000000029 | -0.439 | 0.127 | 0.22 |
| -1.642500000000029 | -0.442 | 0.125 | 0.219 |
| -1.640000000000029 | -0.446 | 0.123 | 0.217 |
| -1.637500000000029 | -0.45 | 0.121 | 0.216 |
| -1.63500000000003 | -0.454 | 0.12 | 0.215 |
| -1.63250000000003 | -0.458 | 0.118 | 0.214 |
| -1.63000000000003 | -0.462 | 0.116 | 0.212 |
| -1.627500000000029 | -0.466 | 0.114 | 0.211 |
| -1.625000000000029 | -0.47 | 0.112 | 0.21 |
| -1.622500000000029 | -0.474 | 0.11 | 0.208 |
| -1.620000000000029 | -0.478 | 0.108 | 0.207 |
| -1.617500000000029 | -0.482 | 0.106 | 0.206 |
| -1.615000000000029 | -0.486 | 0.104 | 0.204 |
| -1.612500000000029 | -0.49 | 0.101 | 0.203 |
| -1.61000000000003 | -0.494 | 0.099 | 0.201 |
| -1.60750000000003 | -0.498 | 0.097 | 0.2 |
| -1.60500000000003 | -0.503 | 0.095 | 0.199 |
| -1.60250000000003 | -0.507 | 0.093 | 0.197 |
| -1.60000000000003 | -0.511 | 0.091 | 0.196 |
| -1.59750000000003 | -0.515 | 0.089 | 0.195 |
| -1.59500000000003 | -0.519 | 0.087 | 0.193 |
| -1.59250000000003 | -0.523 | 0.085 | 0.192 |
| -1.59000000000003 | -0.528 | 0.083 | 0.19 |
| -1.58750000000003 | -0.532 | 0.081 | 0.189 |
| -1.58500000000003 | -0.536 | 0.079 | 0.187 |
| -1.58250000000003 | -0.54 | 0.076 | 0.186 |
| -1.58000000000003 | -0.545 | 0.074 | 0.185 |
| -1.57750000000003 | -0.549 | 0.072 | 0.183 |
| -1.57500000000003 | -0.553 | 0.07 | 0.182 |
| -1.57250000000003 | -0.558 | 0.068 | 0.18 |
| -1.57000000000003 | -0.562 | 0.066 | 0.179 |
| -1.567500000000031 | -0.567 | 0.063 | 0.177 |
| -1.565000000000031 | -0.571 | 0.061 | 0.176 |
| -1.562500000000031 | -0.575 | 0.059 | 0.174 |
| -1.560000000000031 | -0.58 | 0.057 | 0.173 |
| -1.557500000000031 | -0.584 | 0.054 | 0.171 |
| -1.555000000000031 | -0.589 | 0.052 | 0.17 |
| -1.552500000000031 | -0.593 | 0.05 | 0.168 |
| -1.550000000000031 | -0.598 | 0.048 | 0.167 |
| -1.547500000000031 | -0.602 | 0.045 | 0.165 |
| -1.545000000000031 | -0.607 | 0.043 | 0.164 |
| -1.542500000000031 | -0.612 | 0.041 | 0.162 |
| -1.540000000000031 | -0.616 | 0.038 | 0.161 |
| -1.537500000000031 | -0.621 | 0.036 | 0.159 |
| -1.535000000000031 | -0.625 | 0.034 | 0.158 |
| -1.532500000000031 | -0.63 | 0.031 | 0.156 |
| -1.530000000000031 | -0.635 | 0.029 | 0.155 |
| -1.527500000000031 | -0.64 | 0.027 | 0.153 |
| -1.525000000000031 | -0.644 | 0.024 | 0.151 |
| -1.522500000000031 | -0.649 | 0.022 | 0.15 |
| -1.520000000000032 | -0.654 | 0.02 | 0.148 |
| -1.517500000000032 | -0.659 | 0.017 | 0.147 |
| -1.515000000000032 | -0.664 | 0.015 | 0.145 |
| -1.512500000000032 | -0.668 | 0.012 | 0.143 |
| -1.510000000000032 | -0.673 | 0.01 | 0.142 |
| -1.507500000000032 | -0.678 | 0.007 | 0.14 |
| -1.505000000000032 | -0.683 | 0.005 | 0.138 |
| -1.502500000000032 | -0.688 | 0.002 | 0.137 |
| -1.500000000000032 | -0.693 | 0 | 0.135 |
| -1.497500000000032 | -0.698 | -0.003 | 0.133 |
| -1.495000000000032 | -0.703 | -0.005 | 0.132 |
| -1.492500000000032 | -0.708 | -0.008 | 0.13 |
| -1.490000000000032 | -0.713 | -0.01 | 0.128 |
| -1.487500000000032 | -0.718 | -0.013 | 0.127 |
| -1.485000000000032 | -0.724 | -0.015 | 0.125 |
| -1.482500000000032 | -0.729 | -0.018 | 0.123 |
| -1.480000000000032 | -0.734 | -0.02 | 0.122 |
| -1.477500000000032 | -0.739 | -0.023 | 0.12 |
| -1.475000000000032 | -0.744 | -0.026 | 0.118 |
| -1.472500000000033 | -0.75 | -0.028 | 0.116 |
| -1.470000000000033 | -0.755 | -0.031 | 0.115 |
| -1.467500000000033 | -0.76 | -0.034 | 0.113 |
| -1.465000000000033 | -0.766 | -0.036 | 0.111 |
| -1.462500000000033 | -0.771 | -0.039 | 0.109 |
| -1.460000000000033 | -0.777 | -0.042 | 0.107 |
| -1.457500000000033 | -0.782 | -0.044 | 0.106 |
| -1.455000000000033 | -0.787 | -0.047 | 0.104 |
| -1.452500000000033 | -0.793 | -0.05 | 0.102 |
| -1.450000000000033 | -0.799 | -0.053 | 0.1 |
| -1.447500000000033 | -0.804 | -0.055 | 0.098 |
| -1.445000000000033 | -0.81 | -0.058 | 0.096 |
| -1.442500000000033 | -0.815 | -0.061 | 0.094 |
| -1.440000000000033 | -0.821 | -0.064 | 0.093 |
| -1.437500000000033 | -0.827 | -0.067 | 0.091 |
| -1.435000000000033 | -0.832 | -0.07 | 0.089 |
| -1.432500000000033 | -0.838 | -0.073 | 0.087 |
| -1.430000000000033 | -0.844 | -0.075 | 0.085 |
| -1.427500000000033 | -0.85 | -0.078 | 0.083 |
| -1.425000000000034 | -0.856 | -0.081 | 0.081 |
| -1.422500000000034 | -0.862 | -0.084 | 0.079 |
| -1.420000000000034 | -0.868 | -0.087 | 0.077 |
| -1.417500000000034 | -0.873 | -0.09 | 0.075 |
| -1.415000000000034 | -0.879 | -0.093 | 0.073 |
| -1.412500000000034 | -0.886 | -0.096 | 0.071 |
| -1.410000000000034 | -0.892 | -0.099 | 0.069 |
| -1.407500000000034 | -0.898 | -0.102 | 0.067 |
| -1.405000000000034 | -0.904 | -0.105 | 0.065 |
| -1.402500000000034 | -0.91 | -0.108 | 0.063 |
| -1.400000000000034 | -0.916 | -0.112 | 0.061 |
| -1.397500000000034 | -0.923 | -0.115 | 0.059 |
| -1.395000000000034 | -0.929 | -0.118 | 0.057 |
| -1.392500000000034 | -0.935 | -0.121 | 0.054 |
| -1.390000000000034 | -0.942 | -0.124 | 0.052 |
| -1.387500000000034 | -0.948 | -0.127 | 0.05 |
| -1.385000000000034 | -0.955 | -0.131 | 0.048 |
| -1.382500000000034 | -0.961 | -0.134 | 0.046 |
| -1.380000000000034 | -0.968 | -0.137 | 0.044 |
| -1.377500000000035 | -0.974 | -0.141 | 0.041 |
| -1.375000000000035 | -0.981 | -0.144 | 0.039 |
| -1.372500000000035 | -0.988 | -0.147 | 0.037 |
| -1.370000000000035 | -0.994 | -0.151 | 0.035 |
| -1.367500000000035 | -1.001 | -0.154 | 0.033 |
| -1.365000000000035 | -1.008 | -0.157 | 0.03 |
| -1.362500000000035 | -1.015 | -0.161 | 0.028 |
| -1.360000000000035 | -1.022 | -0.164 | 0.026 |
| -1.357500000000035 | -1.029 | -0.168 | 0.023 |
| -1.355000000000035 | -1.036 | -0.171 | 0.021 |
| -1.352500000000035 | -1.043 | -0.175 | 0.019 |
| -1.350000000000035 | -1.05 | -0.178 | 0.016 |
| -1.347500000000035 | -1.057 | -0.182 | 0.014 |
| -1.345000000000035 | -1.064 | -0.186 | 0.011 |
| -1.342500000000035 | -1.071 | -0.189 | 0.009 |
| -1.340000000000035 | -1.079 | -0.193 | 0.007 |
| -1.337500000000035 | -1.086 | -0.197 | 0.004 |
| -1.335000000000035 | -1.094 | -0.2 | 0.002 |
| -1.332500000000035 | -1.101 | -0.204 | -0.001 |
| -1.330000000000036 | -1.109 | -0.208 | -0.003 |
| -1.327500000000036 | -1.116 | -0.212 | -0.006 |
| -1.325000000000036 | -1.124 | -0.215 | -0.008 |
| -1.322500000000036 | -1.132 | -0.219 | -0.011 |
| -1.320000000000036 | -1.139 | -0.223 | -0.014 |
| -1.317500000000036 | -1.147 | -0.227 | -0.016 |
| -1.315000000000036 | -1.155 | -0.231 | -0.019 |
| -1.312500000000036 | -1.163 | -0.235 | -0.022 |
| -1.310000000000036 | -1.171 | -0.239 | -0.024 |
| -1.307500000000036 | -1.179 | -0.243 | -0.027 |
| -1.305000000000036 | -1.187 | -0.247 | -0.03 |
| -1.302500000000036 | -1.196 | -0.251 | -0.032 |
| -1.300000000000036 | -1.204 | -0.255 | -0.035 |
| -1.297500000000036 | -1.212 | -0.26 | -0.038 |
| -1.295000000000036 | -1.221 | -0.264 | -0.041 |
| -1.292500000000036 | -1.229 | -0.268 | -0.044 |
| -1.290000000000036 | -1.238 | -0.272 | -0.046 |
| -1.287500000000036 | -1.247 | -0.277 | -0.049 |
| -1.285000000000037 | -1.255 | -0.281 | -0.052 |
| -1.282500000000037 | -1.264 | -0.285 | -0.055 |
| -1.280000000000037 | -1.273 | -0.29 | -0.058 |
| -1.277500000000037 | -1.282 | -0.294 | -0.061 |
| -1.275000000000037 | -1.291 | -0.299 | -0.064 |
| -1.272500000000037 | -1.3 | -0.303 | -0.067 |
| -1.270000000000037 | -1.309 | -0.308 | -0.07 |
| -1.267500000000037 | -1.319 | -0.313 | -0.073 |
| -1.265000000000037 | -1.328 | -0.317 | -0.076 |
| -1.262500000000037 | -1.338 | -0.322 | -0.08 |
| -1.260000000000037 | -1.347 | -0.327 | -0.083 |
| -1.257500000000037 | -1.357 | -0.332 | -0.086 |
| -1.255000000000037 | -1.366 | -0.337 | -0.089 |
| -1.252500000000037 | -1.376 | -0.342 | -0.093 |
| -1.250000000000037 | -1.386 | -0.347 | -0.096 |
| -1.247500000000037 | -1.396 | -0.352 | -0.099 |
| -1.245000000000037 | -1.406 | -0.357 | -0.103 |
| -1.242500000000037 | -1.417 | -0.362 | -0.106 |
| -1.240000000000037 | -1.427 | -0.367 | -0.11 |
| -1.237500000000038 | -1.438 | -0.372 | -0.113 |
| -1.235000000000038 | -1.448 | -0.378 | -0.117 |
| -1.232500000000038 | -1.459 | -0.383 | -0.12 |
| -1.230000000000038 | -1.47 | -0.388 | -0.124 |
| -1.227500000000038 | -1.481 | -0.394 | -0.127 |
| -1.225000000000038 | -1.492 | -0.399 | -0.131 |
| -1.222500000000038 | -1.503 | -0.405 | -0.135 |
| -1.220000000000038 | -1.514 | -0.41 | -0.139 |
| -1.217500000000038 | -1.526 | -0.416 | -0.142 |
| -1.215000000000038 | -1.537 | -0.422 | -0.146 |
| -1.212500000000038 | -1.549 | -0.428 | -0.15 |
| -1.210000000000038 | -1.561 | -0.434 | -0.154 |
| -1.207500000000038 | -1.573 | -0.44 | -0.158 |
| -1.205000000000038 | -1.585 | -0.446 | -0.162 |
| -1.202500000000038 | -1.597 | -0.452 | -0.166 |
| -1.200000000000038 | -1.609 | -0.458 | -0.17 |
| -1.197500000000038 | -1.622 | -0.464 | -0.174 |
| -1.195000000000038 | -1.635 | -0.471 | -0.179 |
| -1.192500000000038 | -1.648 | -0.477 | -0.183 |
| -1.190000000000039 | -1.661 | -0.484 | -0.187 |
| -1.187500000000039 | -1.674 | -0.49 | -0.192 |
| -1.185000000000039 | -1.687 | -0.497 | -0.196 |
| -1.182500000000039 | -1.701 | -0.504 | -0.201 |
| -1.180000000000039 | -1.715 | -0.511 | -0.205 |
| -1.177500000000039 | -1.729 | -0.518 | -0.21 |
| -1.175000000000039 | -1.743 | -0.525 | -0.215 |
| -1.172500000000039 | -1.757 | -0.532 | -0.22 |
| -1.170000000000039 | -1.772 | -0.539 | -0.224 |
| -1.16750000000004 | -1.787 | -0.547 | -0.229 |
| -1.16500000000004 | -1.802 | -0.554 | -0.234 |
| -1.16250000000004 | -1.817 | -0.562 | -0.239 |
| -1.16000000000004 | -1.833 | -0.57 | -0.245 |
| -1.157500000000039 | -1.848 | -0.578 | -0.25 |
| -1.155000000000039 | -1.864 | -0.586 | -0.255 |
| -1.152500000000039 | -1.881 | -0.594 | -0.261 |
| -1.150000000000039 | -1.897 | -0.602 | -0.266 |
| -1.147500000000039 | -1.914 | -0.61 | -0.272 |
| -1.14500000000004 | -1.931 | -0.619 | -0.277 |
| -1.14250000000004 | -1.948 | -0.628 | -0.283 |
| -1.14000000000004 | -1.966 | -0.636 | -0.289 |
| -1.13750000000004 | -1.984 | -0.645 | -0.295 |
| -1.13500000000004 | -2.002 | -0.655 | -0.301 |
| -1.13250000000004 | -2.021 | -0.664 | -0.308 |
| -1.13000000000004 | -2.04 | -0.674 | -0.314 |
| -1.12750000000004 | -2.06 | -0.683 | -0.32 |
| -1.12500000000004 | -2.079 | -0.693 | -0.327 |
| -1.12250000000004 | -2.1 | -0.703 | -0.334 |
| -1.12000000000004 | -2.12 | -0.714 | -0.341 |
| -1.11750000000004 | -2.141 | -0.724 | -0.348 |
| -1.11500000000004 | -2.163 | -0.735 | -0.355 |
| -1.11250000000004 | -2.185 | -0.746 | -0.362 |
| -1.11000000000004 | -2.207 | -0.757 | -0.37 |
| -1.10750000000004 | -2.23 | -0.769 | -0.377 |
| -1.10500000000004 | -2.254 | -0.78 | -0.385 |
| -1.10250000000004 | -2.278 | -0.792 | -0.393 |
| -1.10000000000004 | -2.303 | -0.805 | -0.401 |
| -1.097500000000041 | -2.328 | -0.817 | -0.41 |
| -1.095000000000041 | -2.354 | -0.83 | -0.418 |
| -1.092500000000041 | -2.381 | -0.844 | -0.427 |
| -1.090000000000041 | -2.408 | -0.857 | -0.436 |
| -1.087500000000041 | -2.436 | -0.871 | -0.446 |
| -1.085000000000041 | -2.465 | -0.886 | -0.455 |
| -1.082500000000041 | -2.495 | -0.901 | -0.465 |
| -1.080000000000041 | -2.526 | -0.916 | -0.476 |
| -1.077500000000041 | -2.557 | -0.932 | -0.486 |
| -1.075000000000041 | -2.59 | -0.949 | -0.497 |
| -1.072500000000041 | -2.624 | -0.966 | -0.509 |
| -1.070000000000041 | -2.659 | -0.983 | -0.52 |
| -1.067500000000041 | -2.696 | -1.001 | -0.532 |
| -1.065000000000041 | -2.733 | -1.02 | -0.545 |
| -1.062500000000041 | -2.773 | -1.04 | -0.558 |
| -1.060000000000041 | -2.813 | -1.06 | -0.572 |
| -1.057500000000041 | -2.856 | -1.081 | -0.586 |
| -1.055000000000041 | -2.9 | -1.104 | -0.601 |
| -1.052500000000042 | -2.947 | -1.127 | -0.616 |
| -1.050000000000042 | -2.996 | -1.151 | -0.632 |
| -1.047500000000042 | -3.047 | -1.177 | -0.649 |
| -1.045000000000042 | -3.101 | -1.204 | -0.667 |
| -1.042500000000042 | -3.158 | -1.233 | -0.687 |
| -1.040000000000042 | -3.219 | -1.263 | -0.707 |
| -1.037500000000042 | -3.283 | -1.295 | -0.728 |
| -1.035000000000042 | -3.352 | -1.33 | -0.751 |
| -1.032500000000042 | -3.427 | -1.367 | -0.776 |
| -1.030000000000042 | -3.507 | -1.407 | -0.803 |
| -1.027500000000042 | -3.594 | -1.45 | -0.832 |
| -1.025000000000042 | -3.689 | -1.498 | -0.863 |
| -1.022500000000042 | -3.794 | -1.551 | -0.899 |
| -1.020000000000042 | -3.912 | -1.609 | -0.938 |
| -1.017500000000042 | -4.046 | -1.676 | -0.982 |
| -1.015000000000042 | -4.2 | -1.753 | -1.034 |
| -1.012500000000042 | -4.382 | -1.844 | -1.094 |
| -1.010000000000042 | -4.605 | -1.956 | -1.169 |
| -1.007500000000042 | -4.893 | -2.1 | -1.265 |
| -1.005000000000043 | -5.298 | -2.303 | -1.4 |
| -1.002500000000043 | -5.991 | -2.649 | -1.631 |
| -1.000000000000043 | -30.786 | -15.047 | -9.896 |
| -0.997500000000043 | -5.991 | -2.649 | -1.631 |
| -0.995000000000043 | -5.298 | -2.303 | -1.4 |
| -0.992500000000043 | -4.893 | -2.1 | -1.265 |
| -0.990000000000043 | -4.605 | -1.956 | -1.169 |
| -0.987500000000043 | -4.382 | -1.844 | -1.094 |
| -0.985000000000043 | -4.2 | -1.753 | -1.034 |
| -0.982500000000043 | -4.046 | -1.676 | -0.982 |
| -0.980000000000043 | -3.912 | -1.609 | -0.938 |
| -0.977500000000043 | -3.794 | -1.551 | -0.899 |
| -0.975000000000043 | -3.689 | -1.498 | -0.863 |
| -0.972500000000043 | -3.594 | -1.45 | -0.832 |
| -0.970000000000043 | -3.507 | -1.407 | -0.803 |
| -0.967500000000043 | -3.427 | -1.367 | -0.776 |
| -0.965000000000043 | -3.352 | -1.33 | -0.751 |
| -0.962500000000043 | -3.283 | -1.295 | -0.728 |
| -0.960000000000043 | -3.219 | -1.263 | -0.707 |
| -0.957500000000044 | -3.158 | -1.233 | -0.687 |
| -0.955000000000044 | -3.101 | -1.204 | -0.667 |
| -0.952500000000044 | -3.047 | -1.177 | -0.649 |
| -0.950000000000044 | -2.996 | -1.151 | -0.632 |
| -0.947500000000044 | -2.947 | -1.127 | -0.616 |
| -0.945000000000044 | -2.9 | -1.104 | -0.601 |
| -0.942500000000044 | -2.856 | -1.081 | -0.586 |
| -0.940000000000044 | -2.813 | -1.06 | -0.572 |
| -0.937500000000044 | -2.773 | -1.04 | -0.558 |
| -0.935000000000044 | -2.733 | -1.02 | -0.545 |
| -0.932500000000044 | -2.696 | -1.001 | -0.532 |
| -0.930000000000044 | -2.659 | -0.983 | -0.52 |
| -0.927500000000044 | -2.624 | -0.966 | -0.509 |
| -0.925000000000044 | -2.59 | -0.949 | -0.497 |
| -0.922500000000044 | -2.557 | -0.932 | -0.486 |
| -0.920000000000044 | -2.526 | -0.916 | -0.476 |
| -0.917500000000044 | -2.495 | -0.901 | -0.465 |
| -0.915000000000044 | -2.465 | -0.886 | -0.455 |
| -0.912500000000044 | -2.436 | -0.871 | -0.446 |
| -0.910000000000045 | -2.408 | -0.857 | -0.436 |
| -0.907500000000045 | -2.381 | -0.844 | -0.427 |
| -0.905000000000045 | -2.354 | -0.83 | -0.418 |
| -0.902500000000045 | -2.328 | -0.817 | -0.41 |
| -0.900000000000045 | -2.303 | -0.805 | -0.401 |
| -0.897500000000045 | -2.278 | -0.792 | -0.393 |
| -0.895000000000045 | -2.254 | -0.78 | -0.385 |
| -0.892500000000045 | -2.23 | -0.769 | -0.377 |
| -0.890000000000045 | -2.207 | -0.757 | -0.37 |
| -0.887500000000045 | -2.185 | -0.746 | -0.362 |
| -0.885000000000045 | -2.163 | -0.735 | -0.355 |
| -0.882500000000045 | -2.141 | -0.724 | -0.348 |
| -0.880000000000045 | -2.12 | -0.714 | -0.341 |
| -0.877500000000045 | -2.1 | -0.703 | -0.334 |
| -0.875000000000045 | -2.079 | -0.693 | -0.327 |
| -0.872500000000045 | -2.06 | -0.683 | -0.32 |
| -0.870000000000045 | -2.04 | -0.674 | -0.314 |
| -0.867500000000045 | -2.021 | -0.664 | -0.308 |
| -0.865000000000045 | -2.002 | -0.655 | -0.301 |
| -0.862500000000046 | -1.984 | -0.645 | -0.295 |
| -0.860000000000046 | -1.966 | -0.636 | -0.289 |
| -0.857500000000046 | -1.948 | -0.628 | -0.283 |
| -0.855000000000046 | -1.931 | -0.619 | -0.277 |
| -0.852500000000046 | -1.914 | -0.61 | -0.272 |
| -0.850000000000046 | -1.897 | -0.602 | -0.266 |
| -0.847500000000046 | -1.881 | -0.594 | -0.261 |
| -0.845000000000046 | -1.864 | -0.586 | -0.255 |
| -0.842500000000046 | -1.848 | -0.578 | -0.25 |
| -0.840000000000046 | -1.833 | -0.57 | -0.245 |
| -0.837500000000046 | -1.817 | -0.562 | -0.239 |
| -0.835000000000046 | -1.802 | -0.554 | -0.234 |
| -0.832500000000046 | -1.787 | -0.547 | -0.229 |
| -0.830000000000046 | -1.772 | -0.539 | -0.224 |
| -0.827500000000046 | -1.757 | -0.532 | -0.22 |
| -0.825000000000046 | -1.743 | -0.525 | -0.215 |
| -0.822500000000046 | -1.729 | -0.518 | -0.21 |
| -0.820000000000046 | -1.715 | -0.511 | -0.205 |
| -0.817500000000046 | -1.701 | -0.504 | -0.201 |
| -0.815000000000047 | -1.687 | -0.497 | -0.196 |
| -0.812500000000047 | -1.674 | -0.49 | -0.192 |
| -0.810000000000047 | -1.661 | -0.484 | -0.187 |
| -0.807500000000047 | -1.648 | -0.477 | -0.183 |
| -0.805000000000047 | -1.635 | -0.471 | -0.179 |
| -0.802500000000047 | -1.622 | -0.464 | -0.174 |
| -0.800000000000047 | -1.609 | -0.458 | -0.17 |
| -0.797500000000047 | -1.597 | -0.452 | -0.166 |
| -0.795000000000047 | -1.585 | -0.446 | -0.162 |
| -0.792500000000047 | -1.573 | -0.44 | -0.158 |
| -0.790000000000047 | -1.561 | -0.434 | -0.154 |
| -0.787500000000047 | -1.549 | -0.428 | -0.15 |
| -0.785000000000047 | -1.537 | -0.422 | -0.146 |
| -0.782500000000047 | -1.526 | -0.416 | -0.142 |
| -0.780000000000047 | -1.514 | -0.41 | -0.139 |
| -0.777500000000047 | -1.503 | -0.405 | -0.135 |
| -0.775000000000047 | -1.492 | -0.399 | -0.131 |
| -0.772500000000047 | -1.481 | -0.394 | -0.127 |
| -0.770000000000047 | -1.47 | -0.388 | -0.124 |
| -0.767500000000048 | -1.459 | -0.383 | -0.12 |
| -0.765000000000048 | -1.448 | -0.378 | -0.117 |
| -0.762500000000048 | -1.438 | -0.372 | -0.113 |
| -0.760000000000048 | -1.427 | -0.367 | -0.11 |
| -0.757500000000048 | -1.417 | -0.362 | -0.106 |
| -0.755000000000048 | -1.406 | -0.357 | -0.103 |
| -0.752500000000048 | -1.396 | -0.352 | -0.099 |
| -0.750000000000048 | -1.386 | -0.347 | -0.096 |
| -0.747500000000048 | -1.376 | -0.342 | -0.093 |
| -0.745000000000048 | -1.366 | -0.337 | -0.089 |
| -0.742500000000048 | -1.357 | -0.332 | -0.086 |
| -0.740000000000048 | -1.347 | -0.327 | -0.083 |
| -0.737500000000048 | -1.338 | -0.322 | -0.08 |
| -0.735000000000048 | -1.328 | -0.317 | -0.076 |
| -0.732500000000048 | -1.319 | -0.313 | -0.073 |
| -0.730000000000048 | -1.309 | -0.308 | -0.07 |
| -0.727500000000048 | -1.3 | -0.303 | -0.067 |
| -0.725000000000048 | -1.291 | -0.299 | -0.064 |
| -0.722500000000048 | -1.282 | -0.294 | -0.061 |
| -0.720000000000049 | -1.273 | -0.29 | -0.058 |
| -0.717500000000049 | -1.264 | -0.285 | -0.055 |
| -0.715000000000049 | -1.255 | -0.281 | -0.052 |
| -0.712500000000049 | -1.247 | -0.277 | -0.049 |
| -0.710000000000049 | -1.238 | -0.272 | -0.046 |
| -0.707500000000049 | -1.229 | -0.268 | -0.044 |
| -0.705000000000049 | -1.221 | -0.264 | -0.041 |
| -0.702500000000049 | -1.212 | -0.26 | -0.038 |
| -0.700000000000049 | -1.204 | -0.255 | -0.035 |
| -0.697500000000049 | -1.196 | -0.251 | -0.032 |
| -0.695000000000049 | -1.187 | -0.247 | -0.03 |
| -0.692500000000049 | -1.179 | -0.243 | -0.027 |
| -0.690000000000049 | -1.171 | -0.239 | -0.024 |
| -0.687500000000049 | -1.163 | -0.235 | -0.022 |
| -0.685000000000049 | -1.155 | -0.231 | -0.019 |
| -0.682500000000049 | -1.147 | -0.227 | -0.016 |
| -0.680000000000049 | -1.139 | -0.223 | -0.014 |
| -0.677500000000049 | -1.132 | -0.219 | -0.011 |
| -0.675000000000049 | -1.124 | -0.215 | -0.008 |
| -0.67250000000005 | -1.116 | -0.212 | -0.006 |
| -0.67000000000005 | -1.109 | -0.208 | -0.003 |
| -0.66750000000005 | -1.101 | -0.204 | -0.001 |
| -0.66500000000005 | -1.094 | -0.2 | 0.002 |
| -0.66250000000005 | -1.086 | -0.197 | 0.004 |
| -0.66000000000005 | -1.079 | -0.193 | 0.007 |
| -0.65750000000005 | -1.071 | -0.189 | 0.009 |
| -0.65500000000005 | -1.064 | -0.186 | 0.011 |
| -0.65250000000005 | -1.057 | -0.182 | 0.014 |
| -0.65000000000005 | -1.05 | -0.178 | 0.016 |
| -0.64750000000005 | -1.043 | -0.175 | 0.019 |
| -0.64500000000005 | -1.036 | -0.171 | 0.021 |
| -0.64250000000005 | -1.029 | -0.168 | 0.023 |
| -0.64000000000005 | -1.022 | -0.164 | 0.026 |
| -0.63750000000005 | -1.015 | -0.161 | 0.028 |
| -0.63500000000005 | -1.008 | -0.157 | 0.03 |
| -0.63250000000005 | -1.001 | -0.154 | 0.033 |
| -0.63000000000005 | -0.994 | -0.151 | 0.035 |
| -0.62750000000005 | -0.988 | -0.147 | 0.037 |
| -0.625000000000051 | -0.981 | -0.144 | 0.039 |
| -0.622500000000051 | -0.974 | -0.141 | 0.041 |
| -0.620000000000051 | -0.968 | -0.137 | 0.044 |
| -0.617500000000051 | -0.961 | -0.134 | 0.046 |
| -0.615000000000051 | -0.955 | -0.131 | 0.048 |
| -0.612500000000051 | -0.948 | -0.127 | 0.05 |
| -0.610000000000051 | -0.942 | -0.124 | 0.052 |
| -0.607500000000051 | -0.935 | -0.121 | 0.054 |
| -0.605000000000051 | -0.929 | -0.118 | 0.057 |
| -0.602500000000051 | -0.923 | -0.115 | 0.059 |
| -0.600000000000051 | -0.916 | -0.112 | 0.061 |
| -0.597500000000051 | -0.91 | -0.108 | 0.063 |
| -0.595000000000051 | -0.904 | -0.105 | 0.065 |
| -0.592500000000051 | -0.898 | -0.102 | 0.067 |
| -0.590000000000051 | -0.892 | -0.099 | 0.069 |
| -0.587500000000051 | -0.886 | -0.096 | 0.071 |
| -0.585000000000051 | -0.879 | -0.093 | 0.073 |
| -0.582500000000052 | -0.873 | -0.09 | 0.075 |
| -0.580000000000052 | -0.868 | -0.087 | 0.077 |
| -0.577500000000052 | -0.862 | -0.084 | 0.079 |
| -0.575000000000052 | -0.856 | -0.081 | 0.081 |
| -0.572500000000052 | -0.85 | -0.078 | 0.083 |
| -0.570000000000052 | -0.844 | -0.075 | 0.085 |
| -0.567500000000052 | -0.838 | -0.073 | 0.087 |
| -0.565000000000052 | -0.832 | -0.07 | 0.089 |
| -0.562500000000052 | -0.827 | -0.067 | 0.091 |
| -0.560000000000052 | -0.821 | -0.064 | 0.093 |
| -0.557500000000052 | -0.815 | -0.061 | 0.094 |
| -0.555000000000052 | -0.81 | -0.058 | 0.096 |
| -0.552500000000052 | -0.804 | -0.055 | 0.098 |
| -0.550000000000052 | -0.799 | -0.053 | 0.1 |
| -0.547500000000052 | -0.793 | -0.05 | 0.102 |
| -0.545000000000052 | -0.787 | -0.047 | 0.104 |
| -0.542500000000052 | -0.782 | -0.044 | 0.106 |
| -0.540000000000052 | -0.777 | -0.042 | 0.107 |
| -0.537500000000052 | -0.771 | -0.039 | 0.109 |
| -0.535000000000053 | -0.766 | -0.036 | 0.111 |
| -0.532500000000053 | -0.76 | -0.034 | 0.113 |
| -0.530000000000053 | -0.755 | -0.031 | 0.115 |
| -0.527500000000053 | -0.75 | -0.028 | 0.116 |
| -0.525000000000053 | -0.744 | -0.026 | 0.118 |
| -0.522500000000053 | -0.739 | -0.023 | 0.12 |
| -0.520000000000053 | -0.734 | -0.02 | 0.122 |
| -0.517500000000053 | -0.729 | -0.018 | 0.123 |
| -0.515000000000053 | -0.724 | -0.015 | 0.125 |
| -0.512500000000053 | -0.718 | -0.013 | 0.127 |
| -0.510000000000053 | -0.713 | -0.01 | 0.128 |
| -0.507500000000053 | -0.708 | -0.008 | 0.13 |
| -0.505000000000053 | -0.703 | -0.005 | 0.132 |
| -0.502500000000053 | -0.698 | -0.003 | 0.133 |
| -0.500000000000053 | -0.693 | 0 | 0.135 |
| -0.497500000000053 | -0.688 | 0.002 | 0.137 |
| -0.495000000000053 | -0.683 | 0.005 | 0.138 |
| -0.492500000000053 | -0.678 | 0.007 | 0.14 |
| -0.490000000000053 | -0.673 | 0.01 | 0.142 |
| -0.487500000000053 | -0.668 | 0.012 | 0.143 |
| -0.485000000000053 | -0.664 | 0.015 | 0.145 |
| -0.482500000000053 | -0.659 | 0.017 | 0.147 |
| -0.480000000000053 | -0.654 | 0.02 | 0.148 |
| -0.477500000000053 | -0.649 | 0.022 | 0.15 |
| -0.475000000000053 | -0.644 | 0.024 | 0.151 |
| -0.472500000000053 | -0.64 | 0.027 | 0.153 |
| -0.470000000000053 | -0.635 | 0.029 | 0.155 |
| -0.467500000000053 | -0.63 | 0.031 | 0.156 |
| -0.465000000000053 | -0.625 | 0.034 | 0.158 |
| -0.462500000000053 | -0.621 | 0.036 | 0.159 |
| -0.460000000000053 | -0.616 | 0.038 | 0.161 |
| -0.457500000000053 | -0.612 | 0.041 | 0.162 |
| -0.455000000000053 | -0.607 | 0.043 | 0.164 |
| -0.452500000000053 | -0.602 | 0.045 | 0.165 |
| -0.450000000000053 | -0.598 | 0.048 | 0.167 |
| -0.447500000000053 | -0.593 | 0.05 | 0.168 |
| -0.445000000000053 | -0.589 | 0.052 | 0.17 |
| -0.442500000000053 | -0.584 | 0.054 | 0.171 |
| -0.440000000000053 | -0.58 | 0.057 | 0.173 |
| -0.437500000000053 | -0.575 | 0.059 | 0.174 |
| -0.435000000000053 | -0.571 | 0.061 | 0.176 |
| -0.432500000000053 | -0.567 | 0.063 | 0.177 |
| -0.430000000000053 | -0.562 | 0.066 | 0.179 |
| -0.427500000000053 | -0.558 | 0.068 | 0.18 |
| -0.425000000000053 | -0.553 | 0.07 | 0.182 |
| -0.422500000000053 | -0.549 | 0.072 | 0.183 |
| -0.420000000000053 | -0.545 | 0.074 | 0.185 |
| -0.417500000000053 | -0.54 | 0.076 | 0.186 |
| -0.415000000000053 | -0.536 | 0.079 | 0.187 |
| -0.412500000000053 | -0.532 | 0.081 | 0.189 |
| -0.410000000000053 | -0.528 | 0.083 | 0.19 |
| -0.407500000000053 | -0.523 | 0.085 | 0.192 |
| -0.405000000000053 | -0.519 | 0.087 | 0.193 |
| -0.402500000000053 | -0.515 | 0.089 | 0.195 |
| -0.400000000000053 | -0.511 | 0.091 | 0.196 |
| -0.397500000000053 | -0.507 | 0.093 | 0.197 |
| -0.395000000000053 | -0.503 | 0.095 | 0.199 |
| -0.392500000000053 | -0.498 | 0.097 | 0.2 |
| -0.390000000000053 | -0.494 | 0.099 | 0.201 |
| -0.387500000000053 | -0.49 | 0.101 | 0.203 |
| -0.385000000000053 | -0.486 | 0.104 | 0.204 |
| -0.382500000000053 | -0.482 | 0.106 | 0.206 |
| -0.380000000000053 | -0.478 | 0.108 | 0.207 |
| -0.377500000000053 | -0.474 | 0.11 | 0.208 |
| -0.375000000000053 | -0.47 | 0.112 | 0.21 |
| -0.372500000000053 | -0.466 | 0.114 | 0.211 |
| -0.370000000000053 | -0.462 | 0.116 | 0.212 |
| -0.367500000000053 | -0.458 | 0.118 | 0.214 |
| -0.365000000000053 | -0.454 | 0.12 | 0.215 |
| -0.362500000000053 | -0.45 | 0.121 | 0.216 |
| -0.360000000000053 | -0.446 | 0.123 | 0.217 |
| -0.357500000000053 | -0.442 | 0.125 | 0.219 |
| -0.355000000000053 | -0.439 | 0.127 | 0.22 |
| -0.352500000000053 | -0.435 | 0.129 | 0.221 |
| -0.350000000000053 | -0.431 | 0.131 | 0.223 |
| -0.347500000000053 | -0.427 | 0.133 | 0.224 |
| -0.345000000000053 | -0.423 | 0.135 | 0.225 |
| -0.342500000000053 | -0.419 | 0.137 | 0.226 |
| -0.340000000000053 | -0.416 | 0.139 | 0.228 |
| -0.337500000000053 | -0.412 | 0.141 | 0.229 |
| -0.335000000000053 | -0.408 | 0.143 | 0.23 |
| -0.332500000000053 | -0.404 | 0.144 | 0.231 |
| -0.330000000000053 | -0.4 | 0.146 | 0.233 |
| -0.327500000000053 | -0.397 | 0.148 | 0.234 |
| -0.325000000000053 | -0.393 | 0.15 | 0.235 |
| -0.322500000000053 | -0.389 | 0.152 | 0.236 |
| -0.320000000000053 | -0.386 | 0.154 | 0.238 |
| -0.317500000000053 | -0.382 | 0.156 | 0.239 |
| -0.315000000000053 | -0.378 | 0.157 | 0.24 |
| -0.312500000000053 | -0.375 | 0.159 | 0.241 |
| -0.310000000000053 | -0.371 | 0.161 | 0.243 |
| -0.307500000000053 | -0.367 | 0.163 | 0.244 |
| -0.305000000000053 | -0.364 | 0.165 | 0.245 |
| -0.302500000000053 | -0.36 | 0.166 | 0.246 |
| -0.300000000000053 | -0.357 | 0.168 | 0.247 |
| -0.297500000000053 | -0.353 | 0.17 | 0.249 |
| -0.295000000000053 | -0.35 | 0.172 | 0.25 |
| -0.292500000000053 | -0.346 | 0.174 | 0.251 |
| -0.290000000000053 | -0.342 | 0.175 | 0.252 |
| -0.287500000000053 | -0.339 | 0.177 | 0.253 |
| -0.285000000000053 | -0.335 | 0.179 | 0.254 |
| -0.282500000000053 | -0.332 | 0.181 | 0.256 |
| -0.280000000000053 | -0.329 | 0.182 | 0.257 |
| -0.277500000000053 | -0.325 | 0.184 | 0.258 |
| -0.275000000000053 | -0.322 | 0.186 | 0.259 |
| -0.272500000000053 | -0.318 | 0.188 | 0.26 |
| -0.270000000000053 | -0.315 | 0.189 | 0.261 |
| -0.267500000000053 | -0.311 | 0.191 | 0.262 |
| -0.265000000000053 | -0.308 | 0.193 | 0.264 |
| -0.262500000000053 | -0.304 | 0.194 | 0.265 |
| -0.260000000000053 | -0.301 | 0.196 | 0.266 |
| -0.257500000000053 | -0.298 | 0.198 | 0.267 |
| -0.255000000000053 | -0.294 | 0.199 | 0.268 |
| -0.252500000000053 | -0.291 | 0.201 | 0.269 |
| -0.250000000000053 | -0.288 | 0.203 | 0.27 |
| -0.247500000000053 | -0.284 | 0.204 | 0.271 |
| -0.245000000000053 | -0.281 | 0.206 | 0.273 |
| -0.242500000000053 | -0.278 | 0.208 | 0.274 |
| -0.240000000000053 | -0.274 | 0.209 | 0.275 |
| -0.237500000000053 | -0.271 | 0.211 | 0.276 |
| -0.235000000000053 | -0.268 | 0.213 | 0.277 |
| -0.232500000000053 | -0.265 | 0.214 | 0.278 |
| -0.230000000000053 | -0.261 | 0.216 | 0.279 |
| -0.227500000000053 | -0.258 | 0.218 | 0.28 |
| -0.225000000000053 | -0.255 | 0.219 | 0.281 |
| -0.222500000000053 | -0.252 | 0.221 | 0.282 |
| -0.220000000000053 | -0.248 | 0.222 | 0.283 |
| -0.217500000000053 | -0.245 | 0.224 | 0.284 |
| -0.215000000000053 | -0.242 | 0.226 | 0.286 |
| -0.212500000000053 | -0.239 | 0.227 | 0.287 |
| -0.210000000000053 | -0.236 | 0.229 | 0.288 |
| -0.207500000000053 | -0.233 | 0.23 | 0.289 |
| -0.205000000000053 | -0.229 | 0.232 | 0.29 |
| -0.202500000000053 | -0.226 | 0.233 | 0.291 |
| -0.200000000000053 | -0.223 | 0.235 | 0.292 |
| -0.197500000000053 | -0.22 | 0.237 | 0.293 |
| -0.195000000000053 | -0.217 | 0.238 | 0.294 |
| -0.192500000000053 | -0.214 | 0.24 | 0.295 |
| -0.190000000000053 | -0.211 | 0.241 | 0.296 |
| -0.187500000000053 | -0.208 | 0.243 | 0.297 |
| -0.185000000000053 | -0.205 | 0.244 | 0.298 |
| -0.182500000000053 | -0.202 | 0.246 | 0.299 |
| -0.180000000000053 | -0.198 | 0.247 | 0.3 |
| -0.177500000000053 | -0.195 | 0.249 | 0.301 |
| -0.175000000000053 | -0.192 | 0.25 | 0.302 |
| -0.172500000000053 | -0.189 | 0.252 | 0.303 |
| -0.170000000000053 | -0.186 | 0.253 | 0.304 |
| -0.167500000000053 | -0.183 | 0.255 | 0.305 |
| -0.165000000000053 | -0.18 | 0.256 | 0.306 |
| -0.162500000000053 | -0.177 | 0.258 | 0.307 |
| -0.160000000000053 | -0.174 | 0.259 | 0.308 |
| -0.157500000000053 | -0.171 | 0.261 | 0.309 |
| -0.155000000000053 | -0.168 | 0.262 | 0.31 |
| -0.152500000000053 | -0.165 | 0.264 | 0.311 |
| -0.150000000000053 | -0.163 | 0.265 | 0.312 |
| -0.147500000000053 | -0.16 | 0.267 | 0.313 |
| -0.145000000000053 | -0.157 | 0.268 | 0.314 |
| -0.142500000000053 | -0.154 | 0.27 | 0.315 |
| -0.140000000000053 | -0.151 | 0.271 | 0.316 |
| -0.137500000000053 | -0.148 | 0.273 | 0.317 |
| -0.135000000000053 | -0.145 | 0.274 | 0.318 |
| -0.132500000000053 | -0.142 | 0.276 | 0.319 |
| -0.130000000000053 | -0.139 | 0.277 | 0.32 |
| -0.127500000000053 | -0.136 | 0.278 | 0.321 |
| -0.125000000000053 | -0.134 | 0.28 | 0.322 |
| -0.122500000000053 | -0.131 | 0.281 | 0.323 |
| -0.120000000000053 | -0.128 | 0.283 | 0.324 |
| -0.117500000000053 | -0.125 | 0.284 | 0.325 |
| -0.115000000000053 | -0.122 | 0.285 | 0.325 |
| -0.112500000000053 | -0.119 | 0.287 | 0.326 |
| -0.110000000000053 | -0.117 | 0.288 | 0.327 |
| -0.107500000000053 | -0.114 | 0.29 | 0.328 |
| -0.105000000000053 | -0.111 | 0.291 | 0.329 |
| -0.102500000000053 | -0.108 | 0.293 | 0.33 |
| -0.100000000000053 | -0.105 | 0.294 | 0.331 |
| -0.0975000000000529 | -0.103 | 0.295 | 0.332 |
| -0.0950000000000529 | -0.1 | 0.297 | 0.333 |
| -0.0925000000000529 | -0.097 | 0.298 | 0.334 |
| -0.0900000000000529 | -0.094 | 0.299 | 0.335 |
| -0.0875000000000529 | -0.092 | 0.301 | 0.336 |
| -0.0850000000000529 | -0.089 | 0.302 | 0.337 |
| -0.0825000000000529 | -0.086 | 0.304 | 0.338 |
| -0.0800000000000529 | -0.083 | 0.305 | 0.338 |
| -0.0775000000000529 | -0.081 | 0.306 | 0.339 |
| -0.0750000000000529 | -0.078 | 0.308 | 0.34 |
| -0.0725000000000529 | -0.075 | 0.309 | 0.341 |
| -0.0700000000000529 | -0.073 | 0.31 | 0.342 |
| -0.0675000000000529 | -0.07 | 0.312 | 0.343 |
| -0.0650000000000529 | -0.067 | 0.313 | 0.344 |
| -0.0625000000000529 | -0.065 | 0.314 | 0.345 |
| -0.0600000000000529 | -0.062 | 0.316 | 0.346 |
| -0.0575000000000529 | -0.059 | 0.317 | 0.346 |
| -0.0550000000000529 | -0.057 | 0.318 | 0.347 |
| -0.0525000000000529 | -0.054 | 0.32 | 0.348 |
| -0.0500000000000529 | -0.051 | 0.321 | 0.349 |
| -0.0475000000000529 | -0.049 | 0.322 | 0.35 |
| -0.0450000000000529 | -0.046 | 0.324 | 0.351 |
| -0.0425000000000529 | -0.043 | 0.325 | 0.352 |
| -0.0400000000000529 | -0.041 | 0.326 | 0.353 |
| -0.0375000000000529 | -0.038 | 0.327 | 0.353 |
| -0.0350000000000529 | -0.036 | 0.329 | 0.354 |
| -0.0325000000000529 | -0.033 | 0.33 | 0.355 |
| -0.0300000000000529 | -0.03 | 0.331 | 0.356 |
| -0.0275000000000529 | -0.028 | 0.333 | 0.357 |
| -0.0250000000000529 | -0.025 | 0.334 | 0.358 |
| -0.0225000000000529 | -0.023 | 0.335 | 0.359 |
| -0.0200000000000529 | -0.02 | 0.336 | 0.359 |
| -0.0175000000000529 | -0.018 | 0.338 | 0.36 |
| -0.0150000000000529 | -0.015 | 0.339 | 0.361 |
| -0.0125000000000529 | -0.013 | 0.34 | 0.362 |
| -0.0100000000000529 | -0.01 | 0.342 | 0.363 |
| -0.00750000000005288 | -0.008 | 0.343 | 0.364 |
| -0.00500000000005288 | -0.005 | 0.344 | 0.365 |
| -0.00250000000005288 | -0.003 | 0.345 | 0.365 |
| -5.2880443079939e-14 | 0 | 0.347 | 0.366 |
| 0.00249999999994712 | 0.002 | 0.348 | 0.367 |
| 0.00499999999994712 | 0.005 | 0.349 | 0.368 |
| 0.00749999999994712 | 0.007 | 0.35 | 0.369 |
| 0.00999999999994712 | 0.01 | 0.352 | 0.37 |
| 0.0124999999999471 | 0.012 | 0.353 | 0.37 |
| 0.0149999999999471 | 0.015 | 0.354 | 0.371 |
| 0.0174999999999471 | 0.017 | 0.355 | 0.372 |
| 0.0199999999999471 | 0.02 | 0.356 | 0.373 |
| 0.0224999999999471 | 0.022 | 0.358 | 0.374 |
| 0.0249999999999471 | 0.025 | 0.359 | 0.374 |
| 0.0274999999999471 | 0.027 | 0.36 | 0.375 |
| 0.0299999999999471 | 0.03 | 0.361 | 0.376 |
| 0.0324999999999471 | 0.032 | 0.363 | 0.377 |
| 0.0349999999999471 | 0.034 | 0.364 | 0.378 |
| 0.0374999999999471 | 0.037 | 0.365 | 0.378 |
| 0.0399999999999471 | 0.039 | 0.366 | 0.379 |
| 0.0424999999999471 | 0.042 | 0.367 | 0.38 |
| 0.0449999999999471 | 0.044 | 0.369 | 0.381 |
| 0.0474999999999471 | 0.046 | 0.37 | 0.382 |
| 0.0499999999999471 | 0.049 | 0.371 | 0.382 |
| 0.0524999999999471 | 0.051 | 0.372 | 0.383 |
| 0.0549999999999471 | 0.054 | 0.373 | 0.384 |
| 0.0574999999999471 | 0.056 | 0.375 | 0.385 |
| 0.0599999999999471 | 0.058 | 0.376 | 0.386 |
| 0.0624999999999471 | 0.061 | 0.377 | 0.386 |
| 0.0649999999999471 | 0.063 | 0.378 | 0.387 |
| 0.0674999999999471 | 0.065 | 0.379 | 0.388 |
| 0.0699999999999471 | 0.068 | 0.38 | 0.389 |
| 0.0724999999999471 | 0.07 | 0.382 | 0.39 |
| 0.0749999999999471 | 0.072 | 0.383 | 0.39 |
| 0.0774999999999471 | 0.075 | 0.384 | 0.391 |
| 0.0799999999999471 | 0.077 | 0.385 | 0.392 |
| 0.0824999999999471 | 0.079 | 0.386 | 0.393 |
| 0.0849999999999471 | 0.082 | 0.387 | 0.393 |
| 0.0874999999999471 | 0.084 | 0.389 | 0.394 |
| 0.0899999999999471 | 0.086 | 0.39 | 0.395 |
| 0.0924999999999471 | 0.088 | 0.391 | 0.396 |
| 0.0949999999999471 | 0.091 | 0.392 | 0.396 |
| 0.0974999999999471 | 0.093 | 0.393 | 0.397 |
| 0.0999999999999471 | 0.095 | 0.394 | 0.398 |
| 0.102499999999947 | 0.098 | 0.395 | 0.399 |
| 0.104999999999947 | 0.1 | 0.396 | 0.399 |
| 0.107499999999947 | 0.102 | 0.398 | 0.4 |
| 0.109999999999947 | 0.104 | 0.399 | 0.401 |
| 0.112499999999947 | 0.107 | 0.4 | 0.402 |
| 0.114999999999947 | 0.109 | 0.401 | 0.402 |
| 0.117499999999947 | 0.111 | 0.402 | 0.403 |
| 0.119999999999947 | 0.113 | 0.403 | 0.404 |
| 0.122499999999947 | 0.116 | 0.404 | 0.405 |
| 0.124999999999947 | 0.118 | 0.405 | 0.405 |
| 0.127499999999947 | 0.12 | 0.407 | 0.406 |
| 0.129999999999947 | 0.122 | 0.408 | 0.407 |
| 0.132499999999947 | 0.124 | 0.409 | 0.408 |
| 0.134999999999947 | 0.127 | 0.41 | 0.408 |
| 0.137499999999947 | 0.129 | 0.411 | 0.409 |
| 0.139999999999947 | 0.131 | 0.412 | 0.41 |
| 0.142499999999947 | 0.133 | 0.413 | 0.411 |
| 0.144999999999947 | 0.135 | 0.414 | 0.411 |
| 0.147499999999947 | 0.138 | 0.415 | 0.412 |
| 0.149999999999947 | 0.14 | 0.416 | 0.413 |
| 0.152499999999947 | 0.142 | 0.418 | 0.414 |
| 0.154999999999947 | 0.144 | 0.419 | 0.414 |
| 0.157499999999947 | 0.146 | 0.42 | 0.415 |
| 0.159999999999947 | 0.148 | 0.421 | 0.416 |
| 0.162499999999947 | 0.151 | 0.422 | 0.416 |
| 0.164999999999947 | 0.153 | 0.423 | 0.417 |
| 0.167499999999947 | 0.155 | 0.424 | 0.418 |
| 0.169999999999947 | 0.157 | 0.425 | 0.419 |
| 0.172499999999947 | 0.159 | 0.426 | 0.419 |
| 0.174999999999947 | 0.161 | 0.427 | 0.42 |
| 0.177499999999947 | 0.163 | 0.428 | 0.421 |
| 0.179999999999947 | 0.166 | 0.429 | 0.421 |
| 0.182499999999947 | 0.168 | 0.43 | 0.422 |
| 0.184999999999947 | 0.17 | 0.431 | 0.423 |
| 0.187499999999947 | 0.172 | 0.432 | 0.423 |
| 0.189999999999947 | 0.174 | 0.434 | 0.424 |
| 0.192499999999947 | 0.176 | 0.435 | 0.425 |
| 0.194999999999947 | 0.178 | 0.436 | 0.426 |
| 0.197499999999947 | 0.18 | 0.437 | 0.426 |
| 0.199999999999947 | 0.182 | 0.438 | 0.427 |
| 0.202499999999947 | 0.184 | 0.439 | 0.428 |
| 0.204999999999947 | 0.186 | 0.44 | 0.428 |
| 0.207499999999947 | 0.189 | 0.441 | 0.429 |
| 0.209999999999947 | 0.191 | 0.442 | 0.43 |
| 0.212499999999947 | 0.193 | 0.443 | 0.43 |
| 0.214999999999947 | 0.195 | 0.444 | 0.431 |
| 0.217499999999947 | 0.197 | 0.445 | 0.432 |
| 0.219999999999947 | 0.199 | 0.446 | 0.432 |
| 0.222499999999947 | 0.201 | 0.447 | 0.433 |
| 0.224999999999947 | 0.203 | 0.448 | 0.434 |
| 0.227499999999947 | 0.205 | 0.449 | 0.435 |
| 0.229999999999947 | 0.207 | 0.45 | 0.435 |
| 0.232499999999947 | 0.209 | 0.451 | 0.436 |
| 0.234999999999947 | 0.211 | 0.452 | 0.437 |
| 0.237499999999947 | 0.213 | 0.453 | 0.437 |
| 0.239999999999947 | 0.215 | 0.454 | 0.438 |
| 0.242499999999947 | 0.217 | 0.455 | 0.439 |
| 0.244999999999947 | 0.219 | 0.456 | 0.439 |
| 0.247499999999947 | 0.221 | 0.457 | 0.44 |
| 0.249999999999947 | 0.223 | 0.458 | 0.441 |
| 0.252499999999947 | 0.225 | 0.459 | 0.441 |
| 0.254999999999947 | 0.227 | 0.46 | 0.442 |
| 0.257499999999947 | 0.229 | 0.461 | 0.443 |
| 0.259999999999947 | 0.231 | 0.462 | 0.443 |
| 0.262499999999947 | 0.233 | 0.463 | 0.444 |
| 0.264999999999947 | 0.235 | 0.464 | 0.445 |
| 0.267499999999947 | 0.237 | 0.465 | 0.445 |
| 0.269999999999947 | 0.239 | 0.466 | 0.446 |
| 0.272499999999947 | 0.241 | 0.467 | 0.447 |
| 0.274999999999947 | 0.243 | 0.468 | 0.447 |
| 0.277499999999947 | 0.245 | 0.469 | 0.448 |
| 0.279999999999947 | 0.247 | 0.47 | 0.448 |
| 0.282499999999947 | 0.249 | 0.471 | 0.449 |
| 0.284999999999947 | 0.251 | 0.472 | 0.45 |
| 0.287499999999947 | 0.253 | 0.473 | 0.45 |
| 0.289999999999947 | 0.255 | 0.474 | 0.451 |
| 0.292499999999947 | 0.257 | 0.475 | 0.452 |
| 0.294999999999947 | 0.259 | 0.476 | 0.452 |
| 0.297499999999947 | 0.26 | 0.477 | 0.453 |
| 0.299999999999947 | 0.262 | 0.478 | 0.454 |
| 0.302499999999947 | 0.264 | 0.479 | 0.454 |
| 0.304999999999947 | 0.266 | 0.48 | 0.455 |
| 0.307499999999947 | 0.268 | 0.481 | 0.456 |
| 0.309999999999947 | 0.27 | 0.482 | 0.456 |
| 0.312499999999947 | 0.272 | 0.483 | 0.457 |
| 0.314999999999947 | 0.274 | 0.483 | 0.457 |
| 0.317499999999947 | 0.276 | 0.484 | 0.458 |
| 0.319999999999947 | 0.278 | 0.485 | 0.459 |
| 0.322499999999947 | 0.28 | 0.486 | 0.459 |
| 0.324999999999947 | 0.281 | 0.487 | 0.46 |
| 0.327499999999947 | 0.283 | 0.488 | 0.461 |
| 0.329999999999947 | 0.285 | 0.489 | 0.461 |
| 0.332499999999947 | 0.287 | 0.49 | 0.462 |
| 0.334999999999947 | 0.289 | 0.491 | 0.463 |
| 0.337499999999947 | 0.291 | 0.492 | 0.463 |
| 0.339999999999947 | 0.293 | 0.493 | 0.464 |
| 0.342499999999947 | 0.295 | 0.494 | 0.464 |
| 0.344999999999947 | 0.296 | 0.495 | 0.465 |
| 0.347499999999947 | 0.298 | 0.496 | 0.466 |
| 0.349999999999947 | 0.3 | 0.497 | 0.466 |
| 0.352499999999947 | 0.302 | 0.498 | 0.467 |
| 0.354999999999947 | 0.304 | 0.498 | 0.467 |
| 0.357499999999947 | 0.306 | 0.499 | 0.468 |
| 0.359999999999947 | 0.307 | 0.5 | 0.469 |
| 0.362499999999947 | 0.309 | 0.501 | 0.469 |
| 0.364999999999947 | 0.311 | 0.502 | 0.47 |
| 0.367499999999947 | 0.313 | 0.503 | 0.471 |
| 0.369999999999947 | 0.315 | 0.504 | 0.471 |
| 0.372499999999947 | 0.317 | 0.505 | 0.472 |
| 0.374999999999947 | 0.318 | 0.506 | 0.472 |
| 0.377499999999947 | 0.32 | 0.507 | 0.473 |
| 0.379999999999947 | 0.322 | 0.508 | 0.474 |
| 0.382499999999947 | 0.324 | 0.509 | 0.474 |
| 0.384999999999947 | 0.326 | 0.509 | 0.475 |
| 0.387499999999947 | 0.328 | 0.51 | 0.475 |
| 0.389999999999947 | 0.329 | 0.511 | 0.476 |
| 0.392499999999947 | 0.331 | 0.512 | 0.477 |
| 0.394999999999947 | 0.333 | 0.513 | 0.477 |
| 0.397499999999947 | 0.335 | 0.514 | 0.478 |
| 0.399999999999947 | 0.336 | 0.515 | 0.478 |
| 0.402499999999947 | 0.338 | 0.516 | 0.479 |
| 0.404999999999947 | 0.34 | 0.517 | 0.48 |
| 0.407499999999947 | 0.342 | 0.517 | 0.48 |
| 0.409999999999947 | 0.344 | 0.518 | 0.481 |
| 0.412499999999947 | 0.345 | 0.519 | 0.481 |
| 0.414999999999947 | 0.347 | 0.52 | 0.482 |
| 0.417499999999947 | 0.349 | 0.521 | 0.483 |
| 0.419999999999947 | 0.351 | 0.522 | 0.483 |
| 0.422499999999947 | 0.352 | 0.523 | 0.484 |
| 0.424999999999947 | 0.354 | 0.524 | 0.484 |
| 0.427499999999947 | 0.356 | 0.525 | 0.485 |
| 0.429999999999947 | 0.358 | 0.525 | 0.485 |
| 0.432499999999947 | 0.359 | 0.526 | 0.486 |
| 0.434999999999947 | 0.361 | 0.527 | 0.487 |
| 0.437499999999947 | 0.363 | 0.528 | 0.487 |
| 0.439999999999947 | 0.365 | 0.529 | 0.488 |
| 0.442499999999947 | 0.366 | 0.53 | 0.488 |
| 0.444999999999947 | 0.368 | 0.531 | 0.489 |
| 0.447499999999947 | 0.37 | 0.531 | 0.489 |
| 0.449999999999947 | 0.372 | 0.532 | 0.49 |
| 0.452499999999947 | 0.373 | 0.533 | 0.491 |
| 0.454999999999947 | 0.375 | 0.534 | 0.491 |
| 0.457499999999947 | 0.377 | 0.535 | 0.492 |
| 0.459999999999947 | 0.378 | 0.536 | 0.492 |
| 0.462499999999947 | 0.38 | 0.537 | 0.493 |
| 0.464999999999947 | 0.382 | 0.538 | 0.493 |
| 0.467499999999947 | 0.384 | 0.538 | 0.494 |
| 0.469999999999947 | 0.385 | 0.539 | 0.495 |
| 0.472499999999947 | 0.387 | 0.54 | 0.495 |
| 0.474999999999947 | 0.389 | 0.541 | 0.496 |
| 0.477499999999947 | 0.39 | 0.542 | 0.496 |
| 0.479999999999947 | 0.392 | 0.543 | 0.497 |
| 0.482499999999947 | 0.394 | 0.543 | 0.497 |
| 0.484999999999947 | 0.395 | 0.544 | 0.498 |
| 0.487499999999947 | 0.397 | 0.545 | 0.499 |
| 0.489999999999947 | 0.399 | 0.546 | 0.499 |
| 0.492499999999947 | 0.4 | 0.547 | 0.5 |
| 0.494999999999947 | 0.402 | 0.548 | 0.5 |
| 0.497499999999947 | 0.404 | 0.548 | 0.501 |
| 0.499999999999947 | 0.405 | 0.549 | 0.501 |
| 0.502499999999947 | 0.407 | 0.55 | 0.502 |
| 0.504999999999947 | 0.409 | 0.551 | 0.502 |
| 0.507499999999947 | 0.41 | 0.552 | 0.503 |
| 0.509999999999947 | 0.412 | 0.553 | 0.504 |
| 0.512499999999947 | 0.414 | 0.553 | 0.504 |
| 0.514999999999947 | 0.415 | 0.554 | 0.505 |
| 0.517499999999947 | 0.417 | 0.555 | 0.505 |
| 0.519999999999947 | 0.419 | 0.556 | 0.506 |
| 0.522499999999947 | 0.42 | 0.557 | 0.506 |
| 0.524999999999947 | 0.422 | 0.558 | 0.507 |
| 0.527499999999947 | 0.424 | 0.558 | 0.507 |
| 0.529999999999947 | 0.425 | 0.559 | 0.508 |
| 0.532499999999947 | 0.427 | 0.56 | 0.509 |
| 0.534999999999947 | 0.429 | 0.561 | 0.509 |
| 0.537499999999947 | 0.43 | 0.562 | 0.51 |
| 0.539999999999947 | 0.432 | 0.562 | 0.51 |
| 0.542499999999947 | 0.433 | 0.563 | 0.511 |
| 0.544999999999947 | 0.435 | 0.564 | 0.511 |
| 0.547499999999946 | 0.437 | 0.565 | 0.512 |
| 0.549999999999946 | 0.438 | 0.566 | 0.512 |
| 0.552499999999946 | 0.44 | 0.567 | 0.513 |
| 0.554999999999946 | 0.441 | 0.567 | 0.513 |
| 0.557499999999946 | 0.443 | 0.568 | 0.514 |
| 0.559999999999946 | 0.445 | 0.569 | 0.514 |
| 0.562499999999946 | 0.446 | 0.57 | 0.515 |
| 0.564999999999946 | 0.448 | 0.571 | 0.515 |
| 0.567499999999946 | 0.449 | 0.571 | 0.516 |
| 0.569999999999946 | 0.451 | 0.572 | 0.517 |
| 0.572499999999946 | 0.453 | 0.573 | 0.517 |
| 0.574999999999946 | 0.454 | 0.574 | 0.518 |
| 0.577499999999946 | 0.456 | 0.574 | 0.518 |
| 0.579999999999946 | 0.457 | 0.575 | 0.519 |
| 0.582499999999946 | 0.459 | 0.576 | 0.519 |
| 0.584999999999946 | 0.461 | 0.577 | 0.52 |
| 0.587499999999946 | 0.462 | 0.578 | 0.52 |
| 0.589999999999946 | 0.464 | 0.578 | 0.521 |
| 0.592499999999945 | 0.465 | 0.579 | 0.521 |
| 0.594999999999945 | 0.467 | 0.58 | 0.522 |
| 0.597499999999945 | 0.468 | 0.581 | 0.522 |
| 0.599999999999945 | 0.47 | 0.582 | 0.523 |
| 0.602499999999945 | 0.472 | 0.582 | 0.523 |
| 0.604999999999945 | 0.473 | 0.583 | 0.524 |
| 0.607499999999945 | 0.475 | 0.584 | 0.524 |
| 0.609999999999945 | 0.476 | 0.585 | 0.525 |
| 0.612499999999945 | 0.478 | 0.585 | 0.525 |
| 0.614999999999945 | 0.479 | 0.586 | 0.526 |
| 0.617499999999945 | 0.481 | 0.587 | 0.526 |
| 0.619999999999945 | 0.482 | 0.588 | 0.527 |
| 0.622499999999945 | 0.484 | 0.589 | 0.528 |
| 0.624999999999945 | 0.486 | 0.589 | 0.528 |
| 0.627499999999945 | 0.487 | 0.59 | 0.529 |
| 0.629999999999945 | 0.489 | 0.591 | 0.529 |
| 0.632499999999945 | 0.49 | 0.592 | 0.53 |
| 0.634999999999945 | 0.492 | 0.592 | 0.53 |
| 0.637499999999944 | 0.493 | 0.593 | 0.531 |
| 0.639999999999944 | 0.495 | 0.594 | 0.531 |
| 0.642499999999944 | 0.496 | 0.595 | 0.532 |
| 0.644999999999944 | 0.498 | 0.595 | 0.532 |
| 0.647499999999944 | 0.499 | 0.596 | 0.533 |
| 0.649999999999944 | 0.501 | 0.597 | 0.533 |
| 0.652499999999944 | 0.502 | 0.598 | 0.534 |
| 0.654999999999944 | 0.504 | 0.598 | 0.534 |
| 0.657499999999944 | 0.505 | 0.599 | 0.535 |
| 0.659999999999944 | 0.507 | 0.6 | 0.535 |
| 0.662499999999944 | 0.508 | 0.601 | 0.536 |
| 0.664999999999944 | 0.51 | 0.601 | 0.536 |
| 0.667499999999944 | 0.511 | 0.602 | 0.537 |
| 0.669999999999944 | 0.513 | 0.603 | 0.537 |
| 0.672499999999944 | 0.514 | 0.604 | 0.538 |
| 0.674999999999944 | 0.516 | 0.604 | 0.538 |
| 0.677499999999944 | 0.517 | 0.605 | 0.539 |
| 0.679999999999944 | 0.519 | 0.606 | 0.539 |
| 0.682499999999943 | 0.52 | 0.607 | 0.54 |
| 0.684999999999943 | 0.522 | 0.607 | 0.54 |
| 0.687499999999943 | 0.523 | 0.608 | 0.541 |
| 0.689999999999943 | 0.525 | 0.609 | 0.541 |
| 0.692499999999943 | 0.526 | 0.61 | 0.542 |
| 0.694999999999943 | 0.528 | 0.61 | 0.542 |
| 0.697499999999943 | 0.529 | 0.611 | 0.543 |
| 0.699999999999943 | 0.531 | 0.612 | 0.543 |
| 0.702499999999943 | 0.532 | 0.613 | 0.544 |
| 0.704999999999943 | 0.534 | 0.613 | 0.544 |
| 0.707499999999943 | 0.535 | 0.614 | 0.545 |
| 0.709999999999943 | 0.536 | 0.615 | 0.545 |
| 0.712499999999943 | 0.538 | 0.616 | 0.546 |
| 0.714999999999943 | 0.539 | 0.616 | 0.546 |
| 0.717499999999943 | 0.541 | 0.617 | 0.546 |
| 0.719999999999943 | 0.542 | 0.618 | 0.547 |
| 0.722499999999943 | 0.544 | 0.618 | 0.547 |
| 0.724999999999943 | 0.545 | 0.619 | 0.548 |
| 0.727499999999943 | 0.547 | 0.62 | 0.548 |
| 0.729999999999943 | 0.548 | 0.621 | 0.549 |
| 0.732499999999942 | 0.55 | 0.621 | 0.549 |
| 0.734999999999942 | 0.551 | 0.622 | 0.55 |
| 0.737499999999942 | 0.552 | 0.623 | 0.55 |
| 0.739999999999942 | 0.554 | 0.624 | 0.551 |
| 0.742499999999942 | 0.555 | 0.624 | 0.551 |
| 0.744999999999942 | 0.557 | 0.625 | 0.552 |
| 0.747499999999942 | 0.558 | 0.626 | 0.552 |
| 0.749999999999942 | 0.56 | 0.626 | 0.553 |
| 0.752499999999942 | 0.561 | 0.627 | 0.553 |
| 0.754999999999942 | 0.562 | 0.628 | 0.554 |
| 0.757499999999942 | 0.564 | 0.629 | 0.554 |
| 0.759999999999942 | 0.565 | 0.629 | 0.555 |
| 0.762499999999942 | 0.567 | 0.63 | 0.555 |
| 0.764999999999942 | 0.568 | 0.631 | 0.556 |
| 0.767499999999942 | 0.57 | 0.631 | 0.556 |
| 0.769999999999942 | 0.571 | 0.632 | 0.557 |
| 0.772499999999942 | 0.572 | 0.633 | 0.557 |
| 0.774999999999942 | 0.574 | 0.633 | 0.557 |
| 0.777499999999941 | 0.575 | 0.634 | 0.558 |
| 0.779999999999941 | 0.577 | 0.635 | 0.558 |
| 0.782499999999941 | 0.578 | 0.636 | 0.559 |
| 0.784999999999941 | 0.579 | 0.636 | 0.559 |
| 0.787499999999941 | 0.581 | 0.637 | 0.56 |
| 0.789999999999941 | 0.582 | 0.638 | 0.56 |
| 0.792499999999941 | 0.584 | 0.638 | 0.561 |
| 0.794999999999941 | 0.585 | 0.639 | 0.561 |
| 0.797499999999941 | 0.586 | 0.64 | 0.562 |
| 0.799999999999941 | 0.588 | 0.64 | 0.562 |
| 0.802499999999941 | 0.589 | 0.641 | 0.563 |
| 0.804999999999941 | 0.591 | 0.642 | 0.563 |
| 0.807499999999941 | 0.592 | 0.643 | 0.564 |
| 0.809999999999941 | 0.593 | 0.643 | 0.564 |
| 0.812499999999941 | 0.595 | 0.644 | 0.564 |
| 0.814999999999941 | 0.596 | 0.645 | 0.565 |
| 0.817499999999941 | 0.597 | 0.645 | 0.565 |
| 0.819999999999941 | 0.599 | 0.646 | 0.566 |
| 0.822499999999941 | 0.6 | 0.647 | 0.566 |
| 0.824999999999941 | 0.602 | 0.647 | 0.567 |
| 0.82749999999994 | 0.603 | 0.648 | 0.567 |
| 0.82999999999994 | 0.604 | 0.649 | 0.568 |
| 0.83249999999994 | 0.606 | 0.649 | 0.568 |
| 0.83499999999994 | 0.607 | 0.65 | 0.569 |
| 0.83749999999994 | 0.608 | 0.651 | 0.569 |
| 0.83999999999994 | 0.61 | 0.651 | 0.569 |
| 0.84249999999994 | 0.611 | 0.652 | 0.57 |
| 0.84499999999994 | 0.612 | 0.653 | 0.57 |
| 0.84749999999994 | 0.614 | 0.653 | 0.571 |
| 0.84999999999994 | 0.615 | 0.654 | 0.571 |
| 0.85249999999994 | 0.617 | 0.655 | 0.572 |
| 0.85499999999994 | 0.618 | 0.656 | 0.572 |
| 0.85749999999994 | 0.619 | 0.656 | 0.573 |
| 0.85999999999994 | 0.621 | 0.657 | 0.573 |
| 0.86249999999994 | 0.622 | 0.658 | 0.574 |
| 0.86499999999994 | 0.623 | 0.658 | 0.574 |
| 0.86749999999994 | 0.625 | 0.659 | 0.574 |
| 0.86999999999994 | 0.626 | 0.66 | 0.575 |
| 0.872499999999939 | 0.627 | 0.66 | 0.575 |
| 0.874999999999939 | 0.629 | 0.661 | 0.576 |
| 0.877499999999939 | 0.63 | 0.662 | 0.576 |
| 0.879999999999939 | 0.631 | 0.662 | 0.577 |
| 0.882499999999939 | 0.633 | 0.663 | 0.577 |
| 0.884999999999939 | 0.634 | 0.664 | 0.578 |
| 0.887499999999939 | 0.635 | 0.664 | 0.578 |
| 0.889999999999939 | 0.637 | 0.665 | 0.578 |
| 0.892499999999939 | 0.638 | 0.666 | 0.579 |
| 0.894999999999939 | 0.639 | 0.666 | 0.579 |
| 0.897499999999939 | 0.641 | 0.667 | 0.58 |
| 0.899999999999939 | 0.642 | 0.668 | 0.58 |
| 0.902499999999939 | 0.643 | 0.668 | 0.581 |
| 0.904999999999939 | 0.644 | 0.669 | 0.581 |
| 0.907499999999939 | 0.646 | 0.669 | 0.581 |
| 0.909999999999939 | 0.647 | 0.67 | 0.582 |
| 0.912499999999939 | 0.648 | 0.671 | 0.582 |
| 0.914999999999939 | 0.65 | 0.671 | 0.583 |
| 0.917499999999939 | 0.651 | 0.672 | 0.583 |
| 0.919999999999939 | 0.652 | 0.673 | 0.584 |
| 0.922499999999938 | 0.654 | 0.673 | 0.584 |
| 0.924999999999938 | 0.655 | 0.674 | 0.585 |
| 0.927499999999938 | 0.656 | 0.675 | 0.585 |
| 0.929999999999938 | 0.658 | 0.675 | 0.585 |
| 0.932499999999938 | 0.659 | 0.676 | 0.586 |
| 0.934999999999938 | 0.66 | 0.677 | 0.586 |
| 0.937499999999938 | 0.661 | 0.677 | 0.587 |
| 0.939999999999938 | 0.663 | 0.678 | 0.587 |
| 0.942499999999938 | 0.664 | 0.679 | 0.588 |
| 0.944999999999938 | 0.665 | 0.679 | 0.588 |
| 0.947499999999938 | 0.667 | 0.68 | 0.588 |
| 0.949999999999938 | 0.668 | 0.68 | 0.589 |
| 0.952499999999938 | 0.669 | 0.681 | 0.589 |
| 0.954999999999938 | 0.67 | 0.682 | 0.59 |
| 0.957499999999938 | 0.672 | 0.682 | 0.59 |
| 0.959999999999938 | 0.673 | 0.683 | 0.591 |
| 0.962499999999938 | 0.674 | 0.684 | 0.591 |
| 0.964999999999938 | 0.675 | 0.684 | 0.591 |
| 0.967499999999937 | 0.677 | 0.685 | 0.592 |
| 0.969999999999937 | 0.678 | 0.686 | 0.592 |
| 0.972499999999937 | 0.679 | 0.686 | 0.593 |
| 0.974999999999937 | 0.681 | 0.687 | 0.593 |
| 0.977499999999937 | 0.682 | 0.687 | 0.593 |
| 0.979999999999937 | 0.683 | 0.688 | 0.594 |
| 0.982499999999937 | 0.684 | 0.689 | 0.594 |
| 0.984999999999937 | 0.686 | 0.689 | 0.595 |
| 0.987499999999937 | 0.687 | 0.69 | 0.595 |
| 0.989999999999937 | 0.688 | 0.691 | 0.596 |
| 0.992499999999937 | 0.689 | 0.691 | 0.596 |
| 0.994999999999937 | 0.691 | 0.692 | 0.596 |
| 0.997499999999937 | 0.692 | 0.693 | 0.597 |
| 0.999999999999937 | 0.693 | 0.693 | 0.597 |
| 1.002499999999937 | 0.694 | 0.694 | 0.598 |
| 1.004999999999937 | 0.696 | 0.694 | 0.598 |
| 1.007499999999937 | 0.697 | 0.695 | 0.599 |
| 1.009999999999937 | 0.698 | 0.696 | 0.599 |
| 1.012499999999937 | 0.699 | 0.696 | 0.599 |
| 1.014999999999937 | 0.701 | 0.697 | 0.6 |
| 1.017499999999937 | 0.702 | 0.698 | 0.6 |
| 1.019999999999937 | 0.703 | 0.698 | 0.601 |
| 1.022499999999936 | 0.704 | 0.699 | 0.601 |
| 1.024999999999936 | 0.706 | 0.699 | 0.601 |
| 1.027499999999936 | 0.707 | 0.7 | 0.602 |
| 1.029999999999936 | 0.708 | 0.701 | 0.602 |
| 1.032499999999936 | 0.709 | 0.701 | 0.603 |
| 1.034999999999936 | 0.71 | 0.702 | 0.603 |
| 1.037499999999936 | 0.712 | 0.702 | 0.603 |
| 1.039999999999936 | 0.713 | 0.703 | 0.604 |
| 1.042499999999936 | 0.714 | 0.704 | 0.604 |
| 1.044999999999936 | 0.715 | 0.704 | 0.605 |
| 1.047499999999936 | 0.717 | 0.705 | 0.605 |
| 1.049999999999936 | 0.718 | 0.705 | 0.605 |
| 1.052499999999936 | 0.719 | 0.706 | 0.606 |
| 1.054999999999936 | 0.72 | 0.707 | 0.606 |
| 1.057499999999936 | 0.721 | 0.707 | 0.607 |
| 1.059999999999936 | 0.723 | 0.708 | 0.607 |
| 1.062499999999936 | 0.724 | 0.709 | 0.608 |
| 1.064999999999936 | 0.725 | 0.709 | 0.608 |
| 1.067499999999935 | 0.726 | 0.71 | 0.608 |
| 1.069999999999935 | 0.728 | 0.71 | 0.609 |
| 1.072499999999935 | 0.729 | 0.711 | 0.609 |
| 1.074999999999935 | 0.73 | 0.712 | 0.61 |
| 1.077499999999935 | 0.731 | 0.712 | 0.61 |
| 1.079999999999935 | 0.732 | 0.713 | 0.61 |
| 1.082499999999935 | 0.734 | 0.713 | 0.611 |
| 1.084999999999935 | 0.735 | 0.714 | 0.611 |
| 1.087499999999935 | 0.736 | 0.715 | 0.612 |
| 1.089999999999935 | 0.737 | 0.715 | 0.612 |
| 1.092499999999935 | 0.738 | 0.716 | 0.612 |
| 1.094999999999935 | 0.74 | 0.716 | 0.613 |
| 1.097499999999935 | 0.741 | 0.717 | 0.613 |
| 1.099999999999935 | 0.742 | 0.718 | 0.614 |
| 1.102499999999935 | 0.743 | 0.718 | 0.614 |
| 1.104999999999935 | 0.744 | 0.719 | 0.614 |
| 1.107499999999935 | 0.746 | 0.719 | 0.615 |
| 1.109999999999935 | 0.747 | 0.72 | 0.615 |
| 1.112499999999935 | 0.748 | 0.721 | 0.615 |
| 1.114999999999934 | 0.749 | 0.721 | 0.616 |
| 1.117499999999934 | 0.75 | 0.722 | 0.616 |
| 1.119999999999934 | 0.751 | 0.722 | 0.617 |
| 1.122499999999934 | 0.753 | 0.723 | 0.617 |
| 1.124999999999934 | 0.754 | 0.723 | 0.617 |
| 1.127499999999934 | 0.755 | 0.724 | 0.618 |
| 1.129999999999934 | 0.756 | 0.725 | 0.618 |
| 1.132499999999934 | 0.757 | 0.725 | 0.619 |
| 1.134999999999934 | 0.758 | 0.726 | 0.619 |
| 1.137499999999934 | 0.76 | 0.726 | 0.619 |
| 1.139999999999934 | 0.761 | 0.727 | 0.62 |
| 1.142499999999934 | 0.762 | 0.728 | 0.62 |
| 1.144999999999934 | 0.763 | 0.728 | 0.621 |
| 1.147499999999934 | 0.764 | 0.729 | 0.621 |
| 1.149999999999934 | 0.765 | 0.729 | 0.621 |
| 1.152499999999934 | 0.767 | 0.73 | 0.622 |
| 1.154999999999934 | 0.768 | 0.73 | 0.622 |
| 1.157499999999934 | 0.769 | 0.731 | 0.623 |
| 1.159999999999934 | 0.77 | 0.732 | 0.623 |
| 1.162499999999933 | 0.771 | 0.732 | 0.623 |
| 1.164999999999933 | 0.772 | 0.733 | 0.624 |
| 1.167499999999933 | 0.774 | 0.733 | 0.624 |
| 1.169999999999933 | 0.775 | 0.734 | 0.624 |
| 1.172499999999933 | 0.776 | 0.735 | 0.625 |
| 1.174999999999933 | 0.777 | 0.735 | 0.625 |
| 1.177499999999933 | 0.778 | 0.736 | 0.626 |
| 1.179999999999933 | 0.779 | 0.736 | 0.626 |
| 1.182499999999933 | 0.78 | 0.737 | 0.626 |
| 1.184999999999933 | 0.782 | 0.737 | 0.627 |
| 1.187499999999933 | 0.783 | 0.738 | 0.627 |
| 1.189999999999933 | 0.784 | 0.739 | 0.628 |
| 1.192499999999933 | 0.785 | 0.739 | 0.628 |
| 1.194999999999933 | 0.786 | 0.74 | 0.628 |
| 1.197499999999933 | 0.787 | 0.74 | 0.629 |
| 1.199999999999933 | 0.788 | 0.741 | 0.629 |
| 1.202499999999933 | 0.79 | 0.741 | 0.629 |
| 1.204999999999933 | 0.791 | 0.742 | 0.63 |
| 1.207499999999933 | 0.792 | 0.743 | 0.63 |
| 1.209999999999932 | 0.793 | 0.743 | 0.631 |
| 1.212499999999932 | 0.794 | 0.744 | 0.631 |
| 1.214999999999932 | 0.795 | 0.744 | 0.631 |
| 1.217499999999932 | 0.796 | 0.745 | 0.632 |
| 1.219999999999932 | 0.798 | 0.745 | 0.632 |
| 1.222499999999932 | 0.799 | 0.746 | 0.632 |
| 1.224999999999932 | 0.8 | 0.746 | 0.633 |
| 1.227499999999932 | 0.801 | 0.747 | 0.633 |
| 1.229999999999932 | 0.802 | 0.748 | 0.634 |
| 1.232499999999932 | 0.803 | 0.748 | 0.634 |
| 1.234999999999932 | 0.804 | 0.749 | 0.634 |
| 1.237499999999932 | 0.805 | 0.749 | 0.635 |
| 1.239999999999932 | 0.806 | 0.75 | 0.635 |
| 1.242499999999932 | 0.808 | 0.75 | 0.635 |
| 1.244999999999932 | 0.809 | 0.751 | 0.636 |
| 1.247499999999932 | 0.81 | 0.751 | 0.636 |
| 1.249999999999932 | 0.811 | 0.752 | 0.637 |
| 1.252499999999932 | 0.812 | 0.753 | 0.637 |
| 1.254999999999931 | 0.813 | 0.753 | 0.637 |
| 1.257499999999931 | 0.814 | 0.754 | 0.638 |
| 1.259999999999931 | 0.815 | 0.754 | 0.638 |
| 1.262499999999931 | 0.816 | 0.755 | 0.638 |
| 1.264999999999931 | 0.818 | 0.755 | 0.639 |
| 1.267499999999931 | 0.819 | 0.756 | 0.639 |
| 1.269999999999931 | 0.82 | 0.756 | 0.639 |
| 1.272499999999931 | 0.821 | 0.757 | 0.64 |
| 1.274999999999931 | 0.822 | 0.758 | 0.64 |
| 1.277499999999931 | 0.823 | 0.758 | 0.641 |
| 1.279999999999931 | 0.824 | 0.759 | 0.641 |
| 1.282499999999931 | 0.825 | 0.759 | 0.641 |
| 1.284999999999931 | 0.826 | 0.76 | 0.642 |
| 1.287499999999931 | 0.827 | 0.76 | 0.642 |
| 1.289999999999931 | 0.829 | 0.761 | 0.642 |
| 1.292499999999931 | 0.83 | 0.761 | 0.643 |
| 1.294999999999931 | 0.831 | 0.762 | 0.643 |
| 1.297499999999931 | 0.832 | 0.762 | 0.643 |
| 1.299999999999931 | 0.833 | 0.763 | 0.644 |
| 1.30249999999993 | 0.834 | 0.764 | 0.644 |
| 1.30499999999993 | 0.835 | 0.764 | 0.645 |
| 1.30749999999993 | 0.836 | 0.765 | 0.645 |
| 1.30999999999993 | 0.837 | 0.765 | 0.645 |
| 1.31249999999993 | 0.838 | 0.766 | 0.646 |
| 1.31499999999993 | 0.839 | 0.766 | 0.646 |
| 1.31749999999993 | 0.84 | 0.767 | 0.646 |
| 1.31999999999993 | 0.842 | 0.767 | 0.647 |
| 1.32249999999993 | 0.843 | 0.768 | 0.647 |
| 1.32499999999993 | 0.844 | 0.768 | 0.647 |
| 1.32749999999993 | 0.845 | 0.769 | 0.648 |
| 1.32999999999993 | 0.846 | 0.77 | 0.648 |
| 1.33249999999993 | 0.847 | 0.77 | 0.649 |
| 1.33499999999993 | 0.848 | 0.771 | 0.649 |
| 1.33749999999993 | 0.849 | 0.771 | 0.649 |
| 1.33999999999993 | 0.85 | 0.772 | 0.65 |
| 1.34249999999993 | 0.851 | 0.772 | 0.65 |
| 1.34499999999993 | 0.852 | 0.773 | 0.65 |
| 1.347499999999929 | 0.853 | 0.773 | 0.651 |
| 1.349999999999929 | 0.854 | 0.774 | 0.651 |
| 1.352499999999929 | 0.855 | 0.774 | 0.651 |
| 1.354999999999929 | 0.857 | 0.775 | 0.652 |
| 1.357499999999929 | 0.858 | 0.775 | 0.652 |
| 1.359999999999929 | 0.859 | 0.776 | 0.652 |
| 1.362499999999929 | 0.86 | 0.776 | 0.653 |
| 1.364999999999929 | 0.861 | 0.777 | 0.653 |
| 1.367499999999929 | 0.862 | 0.777 | 0.653 |
| 1.369999999999929 | 0.863 | 0.778 | 0.654 |
| 1.372499999999929 | 0.864 | 0.779 | 0.654 |
| 1.374999999999929 | 0.865 | 0.779 | 0.655 |
| 1.377499999999929 | 0.866 | 0.78 | 0.655 |
| 1.379999999999929 | 0.867 | 0.78 | 0.655 |
| 1.382499999999929 | 0.868 | 0.781 | 0.656 |
| 1.384999999999929 | 0.869 | 0.781 | 0.656 |
| 1.387499999999929 | 0.87 | 0.782 | 0.656 |
| 1.389999999999929 | 0.871 | 0.782 | 0.657 |
| 1.392499999999929 | 0.872 | 0.783 | 0.657 |
| 1.394999999999928 | 0.873 | 0.783 | 0.657 |
| 1.397499999999928 | 0.874 | 0.784 | 0.658 |
| 1.399999999999928 | 0.875 | 0.784 | 0.658 |
| 1.402499999999928 | 0.877 | 0.785 | 0.658 |
| 1.404999999999928 | 0.878 | 0.785 | 0.659 |
| 1.407499999999928 | 0.879 | 0.786 | 0.659 |
| 1.409999999999928 | 0.88 | 0.786 | 0.659 |
| 1.412499999999928 | 0.881 | 0.787 | 0.66 |
| 1.414999999999928 | 0.882 | 0.787 | 0.66 |
| 1.417499999999928 | 0.883 | 0.788 | 0.66 |
| 1.419999999999928 | 0.884 | 0.788 | 0.661 |
| 1.422499999999928 | 0.885 | 0.789 | 0.661 |
| 1.424999999999928 | 0.886 | 0.789 | 0.661 |
| 1.427499999999928 | 0.887 | 0.79 | 0.662 |
| 1.429999999999928 | 0.888 | 0.791 | 0.662 |
| 1.432499999999928 | 0.889 | 0.791 | 0.663 |
| 1.434999999999928 | 0.89 | 0.792 | 0.663 |
| 1.437499999999928 | 0.891 | 0.792 | 0.663 |
| 1.439999999999928 | 0.892 | 0.793 | 0.664 |
| 1.442499999999927 | 0.893 | 0.793 | 0.664 |
| 1.444999999999927 | 0.894 | 0.794 | 0.664 |
| 1.447499999999927 | 0.895 | 0.794 | 0.665 |
| 1.449999999999927 | 0.896 | 0.795 | 0.665 |
| 1.452499999999927 | 0.897 | 0.795 | 0.665 |
| 1.454999999999927 | 0.898 | 0.796 | 0.666 |
| 1.457499999999927 | 0.899 | 0.796 | 0.666 |
| 1.459999999999927 | 0.9 | 0.797 | 0.666 |
| 1.462499999999927 | 0.901 | 0.797 | 0.667 |
| 1.464999999999927 | 0.902 | 0.798 | 0.667 |
| 1.467499999999927 | 0.903 | 0.798 | 0.667 |
| 1.469999999999927 | 0.904 | 0.799 | 0.668 |
| 1.472499999999927 | 0.905 | 0.799 | 0.668 |
| 1.474999999999927 | 0.906 | 0.8 | 0.668 |
| 1.477499999999927 | 0.907 | 0.8 | 0.669 |
| 1.479999999999927 | 0.908 | 0.801 | 0.669 |
| 1.482499999999927 | 0.909 | 0.801 | 0.669 |
| 1.484999999999927 | 0.91 | 0.802 | 0.67 |
| 1.487499999999927 | 0.911 | 0.802 | 0.67 |
| 1.489999999999926 | 0.912 | 0.803 | 0.67 |
| 1.492499999999926 | 0.913 | 0.803 | 0.671 |
| 1.494999999999926 | 0.914 | 0.804 | 0.671 |
| 1.497499999999926 | 0.915 | 0.804 | 0.671 |
| 1.499999999999926 | 0.916 | 0.805 | 0.672 |
| 1.502499999999926 | 0.917 | 0.805 | 0.672 |
| 1.504999999999926 | 0.918 | 0.806 | 0.672 |
| 1.507499999999926 | 0.919 | 0.806 | 0.673 |
| 1.509999999999926 | 0.92 | 0.807 | 0.673 |
| 1.512499999999926 | 0.921 | 0.807 | 0.673 |
| 1.514999999999926 | 0.922 | 0.808 | 0.674 |
| 1.517499999999926 | 0.923 | 0.808 | 0.674 |
| 1.519999999999926 | 0.924 | 0.809 | 0.674 |
| 1.522499999999926 | 0.925 | 0.809 | 0.675 |
| 1.524999999999926 | 0.926 | 0.81 | 0.675 |
| 1.527499999999926 | 0.927 | 0.81 | 0.675 |
| 1.529999999999926 | 0.928 | 0.811 | 0.676 |
| 1.532499999999926 | 0.929 | 0.811 | 0.676 |
| 1.534999999999926 | 0.93 | 0.812 | 0.676 |
| 1.537499999999925 | 0.931 | 0.812 | 0.677 |
| 1.539999999999925 | 0.932 | 0.813 | 0.677 |
| 1.542499999999925 | 0.933 | 0.813 | 0.677 |
| 1.544999999999925 | 0.934 | 0.814 | 0.678 |
| 1.547499999999925 | 0.935 | 0.814 | 0.678 |
| 1.549999999999925 | 0.936 | 0.815 | 0.678 |
| 1.552499999999925 | 0.937 | 0.815 | 0.679 |
| 1.554999999999925 | 0.938 | 0.816 | 0.679 |
| 1.557499999999925 | 0.939 | 0.816 | 0.679 |
| 1.559999999999925 | 0.94 | 0.817 | 0.68 |
| 1.562499999999925 | 0.941 | 0.817 | 0.68 |
| 1.564999999999925 | 0.942 | 0.818 | 0.68 |
| 1.567499999999925 | 0.943 | 0.818 | 0.681 |
| 1.569999999999925 | 0.944 | 0.819 | 0.681 |
| 1.572499999999925 | 0.945 | 0.819 | 0.681 |
| 1.574999999999925 | 0.946 | 0.819 | 0.681 |
| 1.577499999999925 | 0.947 | 0.82 | 0.682 |
| 1.579999999999925 | 0.948 | 0.82 | 0.682 |
| 1.582499999999925 | 0.949 | 0.821 | 0.682 |
| 1.584999999999924 | 0.95 | 0.821 | 0.683 |
| 1.587499999999924 | 0.951 | 0.822 | 0.683 |
| 1.589999999999924 | 0.952 | 0.822 | 0.683 |
| 1.592499999999924 | 0.953 | 0.823 | 0.684 |
| 1.594999999999924 | 0.954 | 0.823 | 0.684 |
| 1.597499999999924 | 0.955 | 0.824 | 0.684 |
| 1.599999999999924 | 0.956 | 0.824 | 0.685 |
| 1.602499999999924 | 0.956 | 0.825 | 0.685 |
| 1.604999999999924 | 0.957 | 0.825 | 0.685 |
| 1.607499999999924 | 0.958 | 0.826 | 0.686 |
| 1.609999999999924 | 0.959 | 0.826 | 0.686 |
| 1.612499999999924 | 0.96 | 0.827 | 0.686 |
| 1.614999999999924 | 0.961 | 0.827 | 0.687 |
| 1.617499999999924 | 0.962 | 0.828 | 0.687 |
| 1.619999999999924 | 0.963 | 0.828 | 0.687 |
| 1.622499999999924 | 0.964 | 0.829 | 0.688 |
| 1.624999999999924 | 0.965 | 0.829 | 0.688 |
| 1.627499999999923 | 0.966 | 0.83 | 0.688 |
| 1.629999999999923 | 0.967 | 0.83 | 0.689 |
| 1.632499999999923 | 0.968 | 0.831 | 0.689 |
| 1.634999999999923 | 0.969 | 0.831 | 0.689 |
| 1.637499999999923 | 0.97 | 0.831 | 0.689 |
| 1.639999999999923 | 0.971 | 0.832 | 0.69 |
| 1.642499999999923 | 0.972 | 0.832 | 0.69 |
| 1.644999999999923 | 0.973 | 0.833 | 0.69 |
| 1.647499999999923 | 0.974 | 0.833 | 0.691 |
| 1.649999999999923 | 0.975 | 0.834 | 0.691 |
| 1.652499999999923 | 0.976 | 0.834 | 0.691 |
| 1.654999999999923 | 0.976 | 0.835 | 0.692 |
| 1.657499999999923 | 0.977 | 0.835 | 0.692 |
| 1.659999999999923 | 0.978 | 0.836 | 0.692 |
| 1.662499999999923 | 0.979 | 0.836 | 0.693 |
| 1.664999999999923 | 0.98 | 0.837 | 0.693 |
| 1.667499999999923 | 0.981 | 0.837 | 0.693 |
| 1.669999999999923 | 0.982 | 0.838 | 0.694 |
| 1.672499999999923 | 0.983 | 0.838 | 0.694 |
| 1.674999999999922 | 0.984 | 0.839 | 0.694 |
| 1.677499999999922 | 0.985 | 0.839 | 0.694 |
| 1.679999999999922 | 0.986 | 0.839 | 0.695 |
| 1.682499999999922 | 0.987 | 0.84 | 0.695 |
| 1.684999999999922 | 0.988 | 0.84 | 0.695 |
| 1.687499999999922 | 0.989 | 0.841 | 0.696 |
| 1.689999999999922 | 0.99 | 0.841 | 0.696 |
| 1.692499999999922 | 0.99 | 0.842 | 0.696 |
| 1.694999999999922 | 0.991 | 0.842 | 0.697 |
| 1.697499999999922 | 0.992 | 0.843 | 0.697 |
| 1.699999999999922 | 0.993 | 0.843 | 0.697 |
| 1.702499999999922 | 0.994 | 0.844 | 0.698 |
| 1.704999999999922 | 0.995 | 0.844 | 0.698 |
| 1.707499999999922 | 0.996 | 0.845 | 0.698 |
| 1.709999999999922 | 0.997 | 0.845 | 0.699 |
| 1.712499999999922 | 0.998 | 0.846 | 0.699 |
| 1.714999999999922 | 0.999 | 0.846 | 0.699 |
| 1.717499999999922 | 1 | 0.846 | 0.699 |
| 1.719999999999922 | 1.001 | 0.847 | 0.7 |
| 1.722499999999921 | 1.002 | 0.847 | 0.7 |
| 1.724999999999921 | 1.002 | 0.848 | 0.7 |
| 1.727499999999921 | 1.003 | 0.848 | 0.701 |
| 1.729999999999921 | 1.004 | 0.849 | 0.701 |
| 1.732499999999921 | 1.005 | 0.849 | 0.701 |
| 1.734999999999921 | 1.006 | 0.85 | 0.702 |
| 1.737499999999921 | 1.007 | 0.85 | 0.702 |
| 1.739999999999921 | 1.008 | 0.851 | 0.702 |
| 1.742499999999921 | 1.009 | 0.851 | 0.702 |
| 1.744999999999921 | 1.01 | 0.851 | 0.703 |
| 1.747499999999921 | 1.011 | 0.852 | 0.703 |
| 1.749999999999921 | 1.012 | 0.852 | 0.703 |
| 1.752499999999921 | 1.013 | 0.853 | 0.704 |
| 1.754999999999921 | 1.013 | 0.853 | 0.704 |
| 1.757499999999921 | 1.014 | 0.854 | 0.704 |
| 1.759999999999921 | 1.015 | 0.854 | 0.705 |
| 1.762499999999921 | 1.016 | 0.855 | 0.705 |
| 1.764999999999921 | 1.017 | 0.855 | 0.705 |
| 1.76749999999992 | 1.018 | 0.856 | 0.706 |
| 1.76999999999992 | 1.019 | 0.856 | 0.706 |
| 1.77249999999992 | 1.02 | 0.856 | 0.706 |
| 1.77499999999992 | 1.021 | 0.857 | 0.706 |
| 1.77749999999992 | 1.022 | 0.857 | 0.707 |
| 1.77999999999992 | 1.022 | 0.858 | 0.707 |
| 1.78249999999992 | 1.023 | 0.858 | 0.707 |
| 1.78499999999992 | 1.024 | 0.859 | 0.708 |
| 1.78749999999992 | 1.025 | 0.859 | 0.708 |
| 1.78999999999992 | 1.026 | 0.86 | 0.708 |
| 1.79249999999992 | 1.027 | 0.86 | 0.709 |
| 1.79499999999992 | 1.028 | 0.86 | 0.709 |
| 1.79749999999992 | 1.029 | 0.861 | 0.709 |
| 1.79999999999992 | 1.03 | 0.861 | 0.709 |
| 1.80249999999992 | 1.031 | 0.862 | 0.71 |
| 1.80499999999992 | 1.031 | 0.862 | 0.71 |
| 1.80749999999992 | 1.032 | 0.863 | 0.71 |
| 1.80999999999992 | 1.033 | 0.863 | 0.711 |
| 1.81249999999992 | 1.034 | 0.864 | 0.711 |
| 1.81499999999992 | 1.035 | 0.864 | 0.711 |
| 1.817499999999919 | 1.036 | 0.864 | 0.711 |
| 1.819999999999919 | 1.037 | 0.865 | 0.712 |
| 1.822499999999919 | 1.038 | 0.865 | 0.712 |
| 1.824999999999919 | 1.039 | 0.866 | 0.712 |
| 1.827499999999919 | 1.039 | 0.866 | 0.713 |
| 1.829999999999919 | 1.04 | 0.867 | 0.713 |
| 1.832499999999919 | 1.041 | 0.867 | 0.713 |
| 1.834999999999919 | 1.042 | 0.868 | 0.714 |
| 1.837499999999919 | 1.043 | 0.868 | 0.714 |
| 1.839999999999919 | 1.044 | 0.868 | 0.714 |
| 1.842499999999919 | 1.045 | 0.869 | 0.714 |
| 1.844999999999919 | 1.046 | 0.869 | 0.715 |
| 1.847499999999919 | 1.046 | 0.87 | 0.715 |
| 1.849999999999919 | 1.047 | 0.87 | 0.715 |
| 1.852499999999919 | 1.048 | 0.871 | 0.716 |
| 1.854999999999919 | 1.049 | 0.871 | 0.716 |
| 1.857499999999919 | 1.05 | 0.872 | 0.716 |
| 1.859999999999919 | 1.051 | 0.872 | 0.716 |
| 1.862499999999918 | 1.052 | 0.872 | 0.717 |
| 1.864999999999918 | 1.053 | 0.873 | 0.717 |
| 1.867499999999918 | 1.053 | 0.873 | 0.717 |
| 1.869999999999918 | 1.054 | 0.874 | 0.718 |
| 1.872499999999918 | 1.055 | 0.874 | 0.718 |
| 1.874999999999918 | 1.056 | 0.875 | 0.718 |
| 1.877499999999918 | 1.057 | 0.875 | 0.719 |
| 1.879999999999918 | 1.058 | 0.875 | 0.719 |
| 1.882499999999918 | 1.059 | 0.876 | 0.719 |
| 1.884999999999918 | 1.06 | 0.876 | 0.719 |
| 1.887499999999918 | 1.06 | 0.877 | 0.72 |
| 1.889999999999918 | 1.061 | 0.877 | 0.72 |
| 1.892499999999918 | 1.062 | 0.878 | 0.72 |
| 1.894999999999918 | 1.063 | 0.878 | 0.721 |
| 1.897499999999918 | 1.064 | 0.878 | 0.721 |
| 1.899999999999918 | 1.065 | 0.879 | 0.721 |
| 1.902499999999918 | 1.066 | 0.879 | 0.721 |
| 1.904999999999918 | 1.066 | 0.88 | 0.722 |
| 1.907499999999918 | 1.067 | 0.88 | 0.722 |
| 1.909999999999918 | 1.068 | 0.881 | 0.722 |
| 1.912499999999917 | 1.069 | 0.881 | 0.723 |
| 1.914999999999917 | 1.07 | 0.882 | 0.723 |
| 1.917499999999917 | 1.071 | 0.882 | 0.723 |
| 1.919999999999917 | 1.072 | 0.882 | 0.723 |
| 1.922499999999917 | 1.072 | 0.883 | 0.724 |
| 1.924999999999917 | 1.073 | 0.883 | 0.724 |
| 1.927499999999917 | 1.074 | 0.884 | 0.724 |
| 1.929999999999917 | 1.075 | 0.884 | 0.725 |
| 1.932499999999917 | 1.076 | 0.885 | 0.725 |
| 1.934999999999917 | 1.077 | 0.885 | 0.725 |
| 1.937499999999917 | 1.078 | 0.885 | 0.725 |
| 1.939999999999917 | 1.078 | 0.886 | 0.726 |
| 1.942499999999917 | 1.079 | 0.886 | 0.726 |
| 1.944999999999917 | 1.08 | 0.887 | 0.726 |
| 1.947499999999917 | 1.081 | 0.887 | 0.727 |
| 1.949999999999917 | 1.082 | 0.887 | 0.727 |
| 1.952499999999917 | 1.083 | 0.888 | 0.727 |
| 1.954999999999917 | 1.083 | 0.888 | 0.727 |
| 1.957499999999916 | 1.084 | 0.889 | 0.728 |
| 1.959999999999916 | 1.085 | 0.889 | 0.728 |
| 1.962499999999916 | 1.086 | 0.89 | 0.728 |
| 1.964999999999916 | 1.087 | 0.89 | 0.728 |
| 1.967499999999916 | 1.088 | 0.89 | 0.729 |
| 1.969999999999916 | 1.089 | 0.891 | 0.729 |
| 1.972499999999916 | 1.089 | 0.891 | 0.729 |
| 1.974999999999916 | 1.09 | 0.892 | 0.73 |
| 1.977499999999916 | 1.091 | 0.892 | 0.73 |
| 1.979999999999916 | 1.092 | 0.893 | 0.73 |
| 1.982499999999916 | 1.093 | 0.893 | 0.73 |
| 1.984999999999916 | 1.094 | 0.893 | 0.731 |
| 1.987499999999916 | 1.094 | 0.894 | 0.731 |
| 1.989999999999916 | 1.095 | 0.894 | 0.731 |
| 1.992499999999916 | 1.096 | 0.895 | 0.732 |
| 1.994999999999916 | 1.097 | 0.895 | 0.732 |
| 1.997499999999916 | 1.098 | 0.895 | 0.732 |
| 1.999999999999916 | 1.099 | 0.896 | 0.732 |